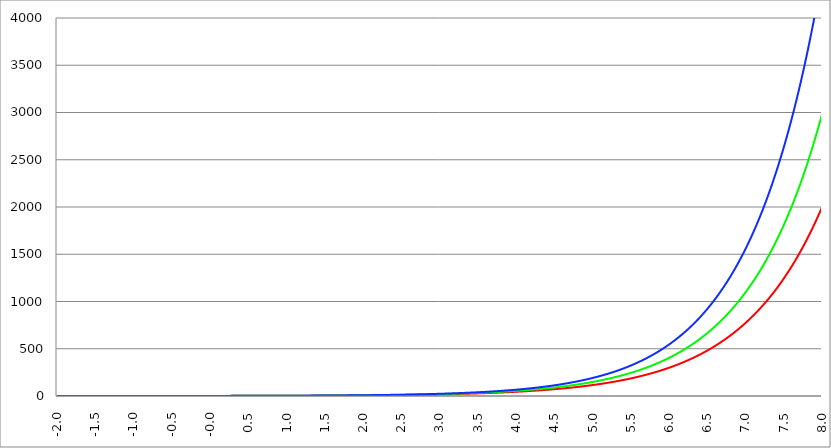
| Category | Series 1 | Series 0 | Series 2 |
|---|---|---|---|
| -2.0 | 0.15 | 0.135 | 0.122 |
| -1.995 | 0.15 | 0.136 | 0.123 |
| -1.99 | 0.151 | 0.137 | 0.124 |
| -1.985 | 0.152 | 0.137 | 0.124 |
| -1.98 | 0.152 | 0.138 | 0.125 |
| -1.975000000000001 | 0.153 | 0.139 | 0.126 |
| -1.970000000000001 | 0.154 | 0.139 | 0.126 |
| -1.965000000000001 | 0.155 | 0.14 | 0.127 |
| -1.960000000000001 | 0.155 | 0.141 | 0.128 |
| -1.955000000000001 | 0.156 | 0.142 | 0.128 |
| -1.950000000000001 | 0.157 | 0.142 | 0.129 |
| -1.945000000000001 | 0.158 | 0.143 | 0.13 |
| -1.940000000000001 | 0.158 | 0.144 | 0.13 |
| -1.935000000000001 | 0.159 | 0.144 | 0.131 |
| -1.930000000000001 | 0.16 | 0.145 | 0.132 |
| -1.925000000000002 | 0.161 | 0.146 | 0.132 |
| -1.920000000000002 | 0.161 | 0.147 | 0.133 |
| -1.915000000000002 | 0.162 | 0.147 | 0.134 |
| -1.910000000000002 | 0.163 | 0.148 | 0.135 |
| -1.905000000000002 | 0.164 | 0.149 | 0.135 |
| -1.900000000000002 | 0.164 | 0.15 | 0.136 |
| -1.895000000000002 | 0.165 | 0.15 | 0.137 |
| -1.890000000000002 | 0.166 | 0.151 | 0.137 |
| -1.885000000000002 | 0.167 | 0.152 | 0.138 |
| -1.880000000000002 | 0.168 | 0.153 | 0.139 |
| -1.875000000000003 | 0.168 | 0.153 | 0.14 |
| -1.870000000000003 | 0.169 | 0.154 | 0.14 |
| -1.865000000000003 | 0.17 | 0.155 | 0.141 |
| -1.860000000000003 | 0.171 | 0.156 | 0.142 |
| -1.855000000000003 | 0.172 | 0.156 | 0.143 |
| -1.850000000000003 | 0.172 | 0.157 | 0.143 |
| -1.845000000000003 | 0.173 | 0.158 | 0.144 |
| -1.840000000000003 | 0.174 | 0.159 | 0.145 |
| -1.835000000000003 | 0.175 | 0.16 | 0.146 |
| -1.830000000000004 | 0.176 | 0.16 | 0.146 |
| -1.825000000000004 | 0.177 | 0.161 | 0.147 |
| -1.820000000000004 | 0.177 | 0.162 | 0.148 |
| -1.815000000000004 | 0.178 | 0.163 | 0.149 |
| -1.810000000000004 | 0.179 | 0.164 | 0.149 |
| -1.805000000000004 | 0.18 | 0.164 | 0.15 |
| -1.800000000000004 | 0.181 | 0.165 | 0.151 |
| -1.795000000000004 | 0.182 | 0.166 | 0.152 |
| -1.790000000000004 | 0.183 | 0.167 | 0.153 |
| -1.785000000000004 | 0.183 | 0.168 | 0.153 |
| -1.780000000000005 | 0.184 | 0.169 | 0.154 |
| -1.775000000000005 | 0.185 | 0.169 | 0.155 |
| -1.770000000000005 | 0.186 | 0.17 | 0.156 |
| -1.765000000000005 | 0.187 | 0.171 | 0.157 |
| -1.760000000000005 | 0.188 | 0.172 | 0.158 |
| -1.755000000000005 | 0.189 | 0.173 | 0.158 |
| -1.750000000000005 | 0.19 | 0.174 | 0.159 |
| -1.745000000000005 | 0.191 | 0.175 | 0.16 |
| -1.740000000000005 | 0.191 | 0.176 | 0.161 |
| -1.735000000000006 | 0.192 | 0.176 | 0.162 |
| -1.730000000000006 | 0.193 | 0.177 | 0.163 |
| -1.725000000000006 | 0.194 | 0.178 | 0.163 |
| -1.720000000000006 | 0.195 | 0.179 | 0.164 |
| -1.715000000000006 | 0.196 | 0.18 | 0.165 |
| -1.710000000000006 | 0.197 | 0.181 | 0.166 |
| -1.705000000000006 | 0.198 | 0.182 | 0.167 |
| -1.700000000000006 | 0.199 | 0.183 | 0.168 |
| -1.695000000000006 | 0.2 | 0.184 | 0.169 |
| -1.690000000000006 | 0.201 | 0.185 | 0.17 |
| -1.685000000000007 | 0.202 | 0.185 | 0.17 |
| -1.680000000000007 | 0.203 | 0.186 | 0.171 |
| -1.675000000000007 | 0.204 | 0.187 | 0.172 |
| -1.670000000000007 | 0.205 | 0.188 | 0.173 |
| -1.665000000000007 | 0.206 | 0.189 | 0.174 |
| -1.660000000000007 | 0.207 | 0.19 | 0.175 |
| -1.655000000000007 | 0.208 | 0.191 | 0.176 |
| -1.650000000000007 | 0.209 | 0.192 | 0.177 |
| -1.645000000000007 | 0.21 | 0.193 | 0.178 |
| -1.640000000000008 | 0.211 | 0.194 | 0.179 |
| -1.635000000000008 | 0.212 | 0.195 | 0.18 |
| -1.630000000000008 | 0.213 | 0.196 | 0.181 |
| -1.625000000000008 | 0.214 | 0.197 | 0.182 |
| -1.620000000000008 | 0.215 | 0.198 | 0.183 |
| -1.615000000000008 | 0.216 | 0.199 | 0.183 |
| -1.610000000000008 | 0.217 | 0.2 | 0.184 |
| -1.605000000000008 | 0.218 | 0.201 | 0.185 |
| -1.600000000000008 | 0.219 | 0.202 | 0.186 |
| -1.595000000000009 | 0.22 | 0.203 | 0.187 |
| -1.590000000000009 | 0.221 | 0.204 | 0.188 |
| -1.585000000000009 | 0.222 | 0.205 | 0.189 |
| -1.580000000000009 | 0.223 | 0.206 | 0.19 |
| -1.57500000000001 | 0.224 | 0.207 | 0.191 |
| -1.57000000000001 | 0.225 | 0.208 | 0.192 |
| -1.565000000000009 | 0.226 | 0.209 | 0.193 |
| -1.560000000000009 | 0.227 | 0.21 | 0.194 |
| -1.555000000000009 | 0.228 | 0.211 | 0.195 |
| -1.55000000000001 | 0.229 | 0.212 | 0.196 |
| -1.54500000000001 | 0.23 | 0.213 | 0.197 |
| -1.54000000000001 | 0.232 | 0.214 | 0.198 |
| -1.53500000000001 | 0.233 | 0.215 | 0.2 |
| -1.53000000000001 | 0.234 | 0.217 | 0.201 |
| -1.52500000000001 | 0.235 | 0.218 | 0.202 |
| -1.52000000000001 | 0.236 | 0.219 | 0.203 |
| -1.51500000000001 | 0.237 | 0.22 | 0.204 |
| -1.51000000000001 | 0.238 | 0.221 | 0.205 |
| -1.505000000000011 | 0.239 | 0.222 | 0.206 |
| -1.500000000000011 | 0.241 | 0.223 | 0.207 |
| -1.495000000000011 | 0.242 | 0.224 | 0.208 |
| -1.490000000000011 | 0.243 | 0.225 | 0.209 |
| -1.485000000000011 | 0.244 | 0.227 | 0.21 |
| -1.480000000000011 | 0.245 | 0.228 | 0.211 |
| -1.475000000000011 | 0.246 | 0.229 | 0.213 |
| -1.470000000000011 | 0.247 | 0.23 | 0.214 |
| -1.465000000000011 | 0.249 | 0.231 | 0.215 |
| -1.460000000000011 | 0.25 | 0.232 | 0.216 |
| -1.455000000000012 | 0.251 | 0.233 | 0.217 |
| -1.450000000000012 | 0.252 | 0.235 | 0.218 |
| -1.445000000000012 | 0.253 | 0.236 | 0.219 |
| -1.440000000000012 | 0.255 | 0.237 | 0.22 |
| -1.435000000000012 | 0.256 | 0.238 | 0.222 |
| -1.430000000000012 | 0.257 | 0.239 | 0.223 |
| -1.425000000000012 | 0.258 | 0.241 | 0.224 |
| -1.420000000000012 | 0.259 | 0.242 | 0.225 |
| -1.415000000000012 | 0.261 | 0.243 | 0.226 |
| -1.410000000000013 | 0.262 | 0.244 | 0.228 |
| -1.405000000000013 | 0.263 | 0.245 | 0.229 |
| -1.400000000000013 | 0.264 | 0.247 | 0.23 |
| -1.395000000000013 | 0.266 | 0.248 | 0.231 |
| -1.390000000000013 | 0.267 | 0.249 | 0.232 |
| -1.385000000000013 | 0.268 | 0.25 | 0.234 |
| -1.380000000000013 | 0.27 | 0.252 | 0.235 |
| -1.375000000000013 | 0.271 | 0.253 | 0.236 |
| -1.370000000000013 | 0.272 | 0.254 | 0.237 |
| -1.365000000000013 | 0.273 | 0.255 | 0.239 |
| -1.360000000000014 | 0.275 | 0.257 | 0.24 |
| -1.355000000000014 | 0.276 | 0.258 | 0.241 |
| -1.350000000000014 | 0.277 | 0.259 | 0.242 |
| -1.345000000000014 | 0.279 | 0.261 | 0.244 |
| -1.340000000000014 | 0.28 | 0.262 | 0.245 |
| -1.335000000000014 | 0.281 | 0.263 | 0.246 |
| -1.330000000000014 | 0.283 | 0.264 | 0.247 |
| -1.325000000000014 | 0.284 | 0.266 | 0.249 |
| -1.320000000000014 | 0.285 | 0.267 | 0.25 |
| -1.315000000000015 | 0.287 | 0.268 | 0.251 |
| -1.310000000000015 | 0.288 | 0.27 | 0.253 |
| -1.305000000000015 | 0.289 | 0.271 | 0.254 |
| -1.300000000000015 | 0.291 | 0.273 | 0.255 |
| -1.295000000000015 | 0.292 | 0.274 | 0.257 |
| -1.290000000000015 | 0.294 | 0.275 | 0.258 |
| -1.285000000000015 | 0.295 | 0.277 | 0.259 |
| -1.280000000000015 | 0.296 | 0.278 | 0.261 |
| -1.275000000000015 | 0.298 | 0.279 | 0.262 |
| -1.270000000000016 | 0.299 | 0.281 | 0.264 |
| -1.265000000000016 | 0.301 | 0.282 | 0.265 |
| -1.260000000000016 | 0.302 | 0.284 | 0.266 |
| -1.255000000000016 | 0.304 | 0.285 | 0.268 |
| -1.250000000000016 | 0.305 | 0.287 | 0.269 |
| -1.245000000000016 | 0.306 | 0.288 | 0.271 |
| -1.240000000000016 | 0.308 | 0.289 | 0.272 |
| -1.235000000000016 | 0.309 | 0.291 | 0.273 |
| -1.230000000000016 | 0.311 | 0.292 | 0.275 |
| -1.225000000000017 | 0.312 | 0.294 | 0.276 |
| -1.220000000000017 | 0.314 | 0.295 | 0.278 |
| -1.215000000000017 | 0.315 | 0.297 | 0.279 |
| -1.210000000000017 | 0.317 | 0.298 | 0.281 |
| -1.205000000000017 | 0.318 | 0.3 | 0.282 |
| -1.200000000000017 | 0.32 | 0.301 | 0.284 |
| -1.195000000000017 | 0.321 | 0.303 | 0.285 |
| -1.190000000000017 | 0.323 | 0.304 | 0.287 |
| -1.185000000000017 | 0.324 | 0.306 | 0.288 |
| -1.180000000000017 | 0.326 | 0.307 | 0.29 |
| -1.175000000000018 | 0.328 | 0.309 | 0.291 |
| -1.170000000000018 | 0.329 | 0.31 | 0.293 |
| -1.165000000000018 | 0.331 | 0.312 | 0.294 |
| -1.160000000000018 | 0.332 | 0.313 | 0.296 |
| -1.155000000000018 | 0.334 | 0.315 | 0.297 |
| -1.150000000000018 | 0.335 | 0.317 | 0.299 |
| -1.145000000000018 | 0.337 | 0.318 | 0.301 |
| -1.140000000000018 | 0.339 | 0.32 | 0.302 |
| -1.135000000000018 | 0.34 | 0.321 | 0.304 |
| -1.130000000000019 | 0.342 | 0.323 | 0.305 |
| -1.125000000000019 | 0.343 | 0.325 | 0.307 |
| -1.120000000000019 | 0.345 | 0.326 | 0.309 |
| -1.115000000000019 | 0.347 | 0.328 | 0.31 |
| -1.110000000000019 | 0.348 | 0.33 | 0.312 |
| -1.10500000000002 | 0.35 | 0.331 | 0.313 |
| -1.10000000000002 | 0.352 | 0.333 | 0.315 |
| -1.095000000000019 | 0.353 | 0.335 | 0.317 |
| -1.090000000000019 | 0.355 | 0.336 | 0.318 |
| -1.085000000000019 | 0.357 | 0.338 | 0.32 |
| -1.08000000000002 | 0.358 | 0.34 | 0.322 |
| -1.07500000000002 | 0.36 | 0.341 | 0.323 |
| -1.07000000000002 | 0.362 | 0.343 | 0.325 |
| -1.06500000000002 | 0.364 | 0.345 | 0.327 |
| -1.06000000000002 | 0.365 | 0.346 | 0.329 |
| -1.05500000000002 | 0.367 | 0.348 | 0.33 |
| -1.05000000000002 | 0.369 | 0.35 | 0.332 |
| -1.04500000000002 | 0.371 | 0.352 | 0.334 |
| -1.04000000000002 | 0.372 | 0.353 | 0.336 |
| -1.035000000000021 | 0.374 | 0.355 | 0.337 |
| -1.030000000000021 | 0.376 | 0.357 | 0.339 |
| -1.025000000000021 | 0.378 | 0.359 | 0.341 |
| -1.020000000000021 | 0.379 | 0.361 | 0.343 |
| -1.015000000000021 | 0.381 | 0.362 | 0.344 |
| -1.010000000000021 | 0.383 | 0.364 | 0.346 |
| -1.005000000000021 | 0.385 | 0.366 | 0.348 |
| -1.000000000000021 | 0.387 | 0.368 | 0.35 |
| -0.995000000000021 | 0.389 | 0.37 | 0.352 |
| -0.990000000000021 | 0.39 | 0.372 | 0.354 |
| -0.985000000000021 | 0.392 | 0.373 | 0.355 |
| -0.980000000000021 | 0.394 | 0.375 | 0.357 |
| -0.975000000000021 | 0.396 | 0.377 | 0.359 |
| -0.970000000000021 | 0.398 | 0.379 | 0.361 |
| -0.965000000000021 | 0.4 | 0.381 | 0.363 |
| -0.960000000000021 | 0.402 | 0.383 | 0.365 |
| -0.955000000000021 | 0.404 | 0.385 | 0.367 |
| -0.950000000000021 | 0.406 | 0.387 | 0.369 |
| -0.945000000000021 | 0.407 | 0.389 | 0.371 |
| -0.940000000000021 | 0.409 | 0.391 | 0.373 |
| -0.935000000000021 | 0.411 | 0.393 | 0.375 |
| -0.930000000000021 | 0.413 | 0.395 | 0.377 |
| -0.925000000000021 | 0.415 | 0.397 | 0.379 |
| -0.920000000000021 | 0.417 | 0.399 | 0.381 |
| -0.915000000000021 | 0.419 | 0.401 | 0.383 |
| -0.910000000000021 | 0.421 | 0.403 | 0.385 |
| -0.905000000000021 | 0.423 | 0.405 | 0.387 |
| -0.900000000000021 | 0.425 | 0.407 | 0.389 |
| -0.895000000000021 | 0.427 | 0.409 | 0.391 |
| -0.890000000000021 | 0.429 | 0.411 | 0.393 |
| -0.885000000000021 | 0.431 | 0.413 | 0.395 |
| -0.880000000000021 | 0.433 | 0.415 | 0.397 |
| -0.875000000000021 | 0.436 | 0.417 | 0.399 |
| -0.870000000000021 | 0.438 | 0.419 | 0.401 |
| -0.865000000000021 | 0.44 | 0.421 | 0.403 |
| -0.860000000000021 | 0.442 | 0.423 | 0.405 |
| -0.855000000000021 | 0.444 | 0.425 | 0.407 |
| -0.850000000000021 | 0.446 | 0.427 | 0.41 |
| -0.845000000000021 | 0.448 | 0.43 | 0.412 |
| -0.840000000000021 | 0.45 | 0.432 | 0.414 |
| -0.835000000000021 | 0.452 | 0.434 | 0.416 |
| -0.830000000000021 | 0.455 | 0.436 | 0.418 |
| -0.825000000000021 | 0.457 | 0.438 | 0.421 |
| -0.820000000000021 | 0.459 | 0.44 | 0.423 |
| -0.815000000000021 | 0.461 | 0.443 | 0.425 |
| -0.810000000000021 | 0.463 | 0.445 | 0.427 |
| -0.805000000000021 | 0.465 | 0.447 | 0.429 |
| -0.800000000000021 | 0.468 | 0.449 | 0.432 |
| -0.795000000000021 | 0.47 | 0.452 | 0.434 |
| -0.790000000000021 | 0.472 | 0.454 | 0.436 |
| -0.785000000000021 | 0.474 | 0.456 | 0.439 |
| -0.780000000000021 | 0.477 | 0.458 | 0.441 |
| -0.775000000000021 | 0.479 | 0.461 | 0.443 |
| -0.770000000000021 | 0.481 | 0.463 | 0.446 |
| -0.765000000000021 | 0.483 | 0.465 | 0.448 |
| -0.760000000000021 | 0.486 | 0.468 | 0.45 |
| -0.755000000000021 | 0.488 | 0.47 | 0.453 |
| -0.750000000000021 | 0.49 | 0.472 | 0.455 |
| -0.745000000000021 | 0.493 | 0.475 | 0.457 |
| -0.740000000000021 | 0.495 | 0.477 | 0.46 |
| -0.735000000000021 | 0.497 | 0.48 | 0.462 |
| -0.730000000000021 | 0.5 | 0.482 | 0.465 |
| -0.725000000000021 | 0.502 | 0.484 | 0.467 |
| -0.720000000000021 | 0.505 | 0.487 | 0.47 |
| -0.715000000000021 | 0.507 | 0.489 | 0.472 |
| -0.710000000000021 | 0.509 | 0.492 | 0.474 |
| -0.705000000000021 | 0.512 | 0.494 | 0.477 |
| -0.700000000000021 | 0.514 | 0.497 | 0.48 |
| -0.695000000000021 | 0.517 | 0.499 | 0.482 |
| -0.690000000000021 | 0.519 | 0.502 | 0.485 |
| -0.685000000000021 | 0.522 | 0.504 | 0.487 |
| -0.680000000000021 | 0.524 | 0.507 | 0.49 |
| -0.675000000000021 | 0.527 | 0.509 | 0.492 |
| -0.670000000000021 | 0.529 | 0.512 | 0.495 |
| -0.665000000000021 | 0.532 | 0.514 | 0.497 |
| -0.660000000000021 | 0.534 | 0.517 | 0.5 |
| -0.655000000000021 | 0.537 | 0.519 | 0.503 |
| -0.650000000000021 | 0.539 | 0.522 | 0.505 |
| -0.645000000000021 | 0.542 | 0.525 | 0.508 |
| -0.640000000000021 | 0.544 | 0.527 | 0.511 |
| -0.635000000000021 | 0.547 | 0.53 | 0.513 |
| -0.630000000000021 | 0.55 | 0.533 | 0.516 |
| -0.625000000000021 | 0.552 | 0.535 | 0.519 |
| -0.620000000000021 | 0.555 | 0.538 | 0.522 |
| -0.615000000000021 | 0.558 | 0.541 | 0.524 |
| -0.610000000000021 | 0.56 | 0.543 | 0.527 |
| -0.605000000000021 | 0.563 | 0.546 | 0.53 |
| -0.600000000000021 | 0.566 | 0.549 | 0.533 |
| -0.595000000000021 | 0.568 | 0.552 | 0.535 |
| -0.590000000000021 | 0.571 | 0.554 | 0.538 |
| -0.585000000000021 | 0.574 | 0.557 | 0.541 |
| -0.580000000000021 | 0.576 | 0.56 | 0.544 |
| -0.575000000000021 | 0.579 | 0.563 | 0.547 |
| -0.570000000000021 | 0.582 | 0.566 | 0.55 |
| -0.565000000000021 | 0.585 | 0.568 | 0.553 |
| -0.560000000000021 | 0.587 | 0.571 | 0.555 |
| -0.555000000000021 | 0.59 | 0.574 | 0.558 |
| -0.550000000000021 | 0.593 | 0.577 | 0.561 |
| -0.545000000000021 | 0.596 | 0.58 | 0.564 |
| -0.540000000000021 | 0.599 | 0.583 | 0.567 |
| -0.535000000000021 | 0.602 | 0.586 | 0.57 |
| -0.530000000000021 | 0.604 | 0.589 | 0.573 |
| -0.525000000000021 | 0.607 | 0.592 | 0.576 |
| -0.520000000000021 | 0.61 | 0.595 | 0.579 |
| -0.515000000000021 | 0.613 | 0.598 | 0.582 |
| -0.510000000000021 | 0.616 | 0.6 | 0.585 |
| -0.505000000000021 | 0.619 | 0.604 | 0.588 |
| -0.500000000000021 | 0.622 | 0.607 | 0.592 |
| -0.495000000000021 | 0.625 | 0.61 | 0.595 |
| -0.490000000000021 | 0.628 | 0.613 | 0.598 |
| -0.485000000000021 | 0.631 | 0.616 | 0.601 |
| -0.480000000000021 | 0.634 | 0.619 | 0.604 |
| -0.475000000000021 | 0.637 | 0.622 | 0.607 |
| -0.470000000000021 | 0.64 | 0.625 | 0.61 |
| -0.465000000000021 | 0.643 | 0.628 | 0.614 |
| -0.460000000000021 | 0.646 | 0.631 | 0.617 |
| -0.455000000000021 | 0.649 | 0.634 | 0.62 |
| -0.450000000000021 | 0.652 | 0.638 | 0.623 |
| -0.445000000000021 | 0.655 | 0.641 | 0.627 |
| -0.440000000000021 | 0.658 | 0.644 | 0.63 |
| -0.435000000000021 | 0.661 | 0.647 | 0.633 |
| -0.430000000000021 | 0.665 | 0.651 | 0.637 |
| -0.425000000000021 | 0.668 | 0.654 | 0.64 |
| -0.420000000000021 | 0.671 | 0.657 | 0.643 |
| -0.415000000000021 | 0.674 | 0.66 | 0.647 |
| -0.410000000000021 | 0.677 | 0.664 | 0.65 |
| -0.405000000000021 | 0.681 | 0.667 | 0.654 |
| -0.400000000000021 | 0.684 | 0.67 | 0.657 |
| -0.395000000000021 | 0.687 | 0.674 | 0.661 |
| -0.390000000000021 | 0.69 | 0.677 | 0.664 |
| -0.385000000000021 | 0.694 | 0.68 | 0.667 |
| -0.380000000000021 | 0.697 | 0.684 | 0.671 |
| -0.375000000000021 | 0.7 | 0.687 | 0.675 |
| -0.370000000000021 | 0.704 | 0.691 | 0.678 |
| -0.365000000000021 | 0.707 | 0.694 | 0.682 |
| -0.360000000000021 | 0.71 | 0.698 | 0.685 |
| -0.355000000000021 | 0.714 | 0.701 | 0.689 |
| -0.350000000000021 | 0.717 | 0.705 | 0.692 |
| -0.345000000000021 | 0.721 | 0.708 | 0.696 |
| -0.340000000000021 | 0.724 | 0.712 | 0.7 |
| -0.335000000000021 | 0.727 | 0.715 | 0.703 |
| -0.330000000000021 | 0.731 | 0.719 | 0.707 |
| -0.325000000000021 | 0.734 | 0.723 | 0.711 |
| -0.320000000000021 | 0.738 | 0.726 | 0.715 |
| -0.315000000000021 | 0.741 | 0.73 | 0.718 |
| -0.310000000000021 | 0.745 | 0.733 | 0.722 |
| -0.305000000000021 | 0.748 | 0.737 | 0.726 |
| -0.300000000000021 | 0.752 | 0.741 | 0.73 |
| -0.295000000000021 | 0.756 | 0.745 | 0.734 |
| -0.290000000000021 | 0.759 | 0.748 | 0.737 |
| -0.285000000000021 | 0.763 | 0.752 | 0.741 |
| -0.280000000000021 | 0.766 | 0.756 | 0.745 |
| -0.275000000000021 | 0.77 | 0.76 | 0.749 |
| -0.270000000000021 | 0.774 | 0.763 | 0.753 |
| -0.265000000000021 | 0.777 | 0.767 | 0.757 |
| -0.260000000000021 | 0.781 | 0.771 | 0.761 |
| -0.255000000000021 | 0.785 | 0.775 | 0.765 |
| -0.250000000000021 | 0.789 | 0.779 | 0.769 |
| -0.245000000000021 | 0.792 | 0.783 | 0.773 |
| -0.240000000000021 | 0.796 | 0.787 | 0.777 |
| -0.235000000000021 | 0.8 | 0.791 | 0.781 |
| -0.230000000000021 | 0.804 | 0.795 | 0.785 |
| -0.225000000000021 | 0.808 | 0.799 | 0.79 |
| -0.220000000000021 | 0.811 | 0.803 | 0.794 |
| -0.215000000000021 | 0.815 | 0.807 | 0.798 |
| -0.210000000000021 | 0.819 | 0.811 | 0.802 |
| -0.205000000000021 | 0.823 | 0.815 | 0.806 |
| -0.200000000000021 | 0.827 | 0.819 | 0.811 |
| -0.195000000000021 | 0.831 | 0.823 | 0.815 |
| -0.190000000000021 | 0.835 | 0.827 | 0.819 |
| -0.185000000000021 | 0.839 | 0.831 | 0.823 |
| -0.180000000000021 | 0.843 | 0.835 | 0.828 |
| -0.175000000000021 | 0.847 | 0.839 | 0.832 |
| -0.170000000000021 | 0.851 | 0.844 | 0.837 |
| -0.165000000000021 | 0.855 | 0.848 | 0.841 |
| -0.160000000000021 | 0.859 | 0.852 | 0.845 |
| -0.155000000000021 | 0.863 | 0.856 | 0.85 |
| -0.150000000000021 | 0.867 | 0.861 | 0.854 |
| -0.145000000000021 | 0.871 | 0.865 | 0.859 |
| -0.140000000000021 | 0.875 | 0.869 | 0.863 |
| -0.135000000000021 | 0.88 | 0.874 | 0.868 |
| -0.130000000000021 | 0.884 | 0.878 | 0.872 |
| -0.125000000000021 | 0.888 | 0.882 | 0.877 |
| -0.120000000000021 | 0.892 | 0.887 | 0.882 |
| -0.115000000000021 | 0.897 | 0.891 | 0.886 |
| -0.110000000000021 | 0.901 | 0.896 | 0.891 |
| -0.105000000000021 | 0.905 | 0.9 | 0.896 |
| -0.100000000000021 | 0.909 | 0.905 | 0.9 |
| -0.0950000000000205 | 0.914 | 0.909 | 0.905 |
| -0.0900000000000205 | 0.918 | 0.914 | 0.91 |
| -0.0850000000000205 | 0.922 | 0.919 | 0.915 |
| -0.0800000000000205 | 0.927 | 0.923 | 0.919 |
| -0.0750000000000205 | 0.931 | 0.928 | 0.924 |
| -0.0700000000000205 | 0.936 | 0.932 | 0.929 |
| -0.0650000000000205 | 0.94 | 0.937 | 0.934 |
| -0.0600000000000205 | 0.945 | 0.942 | 0.939 |
| -0.0550000000000205 | 0.949 | 0.946 | 0.944 |
| -0.0500000000000205 | 0.954 | 0.951 | 0.949 |
| -0.0450000000000205 | 0.958 | 0.956 | 0.954 |
| -0.0400000000000205 | 0.963 | 0.961 | 0.959 |
| -0.0350000000000205 | 0.967 | 0.966 | 0.964 |
| -0.0300000000000205 | 0.972 | 0.97 | 0.969 |
| -0.0250000000000205 | 0.977 | 0.975 | 0.974 |
| -0.0200000000000205 | 0.981 | 0.98 | 0.979 |
| -0.0150000000000205 | 0.986 | 0.985 | 0.984 |
| -0.0100000000000205 | 0.991 | 0.99 | 0.99 |
| -0.00500000000002049 | 0.995 | 0.995 | 0.995 |
| -2.0495757868666e-14 | 1 | 1 | 1 |
| 0.0049999999999795 | 1.005 | 1.005 | 1.005 |
| 0.0099999999999795 | 1.01 | 1.01 | 1.011 |
| 0.0149999999999795 | 1.014 | 1.015 | 1.016 |
| 0.0199999999999795 | 1.019 | 1.02 | 1.021 |
| 0.0249999999999795 | 1.024 | 1.025 | 1.027 |
| 0.0299999999999795 | 1.029 | 1.03 | 1.032 |
| 0.0349999999999795 | 1.034 | 1.036 | 1.037 |
| 0.0399999999999795 | 1.039 | 1.041 | 1.043 |
| 0.0449999999999795 | 1.044 | 1.046 | 1.048 |
| 0.0499999999999795 | 1.049 | 1.051 | 1.054 |
| 0.0549999999999795 | 1.054 | 1.057 | 1.059 |
| 0.0599999999999795 | 1.059 | 1.062 | 1.065 |
| 0.0649999999999795 | 1.064 | 1.067 | 1.071 |
| 0.0699999999999795 | 1.069 | 1.073 | 1.076 |
| 0.0749999999999795 | 1.074 | 1.078 | 1.082 |
| 0.0799999999999795 | 1.079 | 1.083 | 1.088 |
| 0.0849999999999795 | 1.084 | 1.089 | 1.093 |
| 0.0899999999999795 | 1.089 | 1.094 | 1.099 |
| 0.0949999999999795 | 1.094 | 1.1 | 1.105 |
| 0.0999999999999795 | 1.1 | 1.105 | 1.111 |
| 0.10499999999998 | 1.105 | 1.111 | 1.117 |
| 0.10999999999998 | 1.11 | 1.116 | 1.122 |
| 0.11499999999998 | 1.115 | 1.122 | 1.128 |
| 0.11999999999998 | 1.121 | 1.127 | 1.134 |
| 0.12499999999998 | 1.126 | 1.133 | 1.14 |
| 0.12999999999998 | 1.131 | 1.139 | 1.146 |
| 0.13499999999998 | 1.137 | 1.145 | 1.152 |
| 0.13999999999998 | 1.142 | 1.15 | 1.158 |
| 0.14499999999998 | 1.148 | 1.156 | 1.164 |
| 0.14999999999998 | 1.153 | 1.162 | 1.171 |
| 0.15499999999998 | 1.159 | 1.168 | 1.177 |
| 0.15999999999998 | 1.164 | 1.174 | 1.183 |
| 0.16499999999998 | 1.17 | 1.179 | 1.189 |
| 0.16999999999998 | 1.175 | 1.185 | 1.195 |
| 0.17499999999998 | 1.181 | 1.191 | 1.202 |
| 0.17999999999998 | 1.186 | 1.197 | 1.208 |
| 0.18499999999998 | 1.192 | 1.203 | 1.214 |
| 0.18999999999998 | 1.198 | 1.209 | 1.221 |
| 0.19499999999998 | 1.204 | 1.215 | 1.227 |
| 0.19999999999998 | 1.209 | 1.221 | 1.234 |
| 0.20499999999998 | 1.215 | 1.228 | 1.24 |
| 0.20999999999998 | 1.221 | 1.234 | 1.247 |
| 0.21499999999998 | 1.227 | 1.24 | 1.253 |
| 0.21999999999998 | 1.232 | 1.246 | 1.26 |
| 0.22499999999998 | 1.238 | 1.252 | 1.266 |
| 0.22999999999998 | 1.244 | 1.259 | 1.273 |
| 0.23499999999998 | 1.25 | 1.265 | 1.28 |
| 0.23999999999998 | 1.256 | 1.271 | 1.287 |
| 0.24499999999998 | 1.262 | 1.278 | 1.293 |
| 0.24999999999998 | 1.268 | 1.284 | 1.3 |
| 0.25499999999998 | 1.274 | 1.29 | 1.307 |
| 0.25999999999998 | 1.28 | 1.297 | 1.314 |
| 0.26499999999998 | 1.286 | 1.303 | 1.321 |
| 0.26999999999998 | 1.292 | 1.31 | 1.328 |
| 0.27499999999998 | 1.299 | 1.317 | 1.335 |
| 0.27999999999998 | 1.305 | 1.323 | 1.342 |
| 0.28499999999998 | 1.311 | 1.33 | 1.349 |
| 0.28999999999998 | 1.317 | 1.336 | 1.356 |
| 0.29499999999998 | 1.323 | 1.343 | 1.363 |
| 0.29999999999998 | 1.33 | 1.35 | 1.37 |
| 0.30499999999998 | 1.336 | 1.357 | 1.377 |
| 0.30999999999998 | 1.342 | 1.363 | 1.385 |
| 0.31499999999998 | 1.349 | 1.37 | 1.392 |
| 0.31999999999998 | 1.355 | 1.377 | 1.399 |
| 0.32499999999998 | 1.362 | 1.384 | 1.407 |
| 0.32999999999998 | 1.368 | 1.391 | 1.414 |
| 0.33499999999998 | 1.375 | 1.398 | 1.422 |
| 0.33999999999998 | 1.381 | 1.405 | 1.429 |
| 0.34499999999998 | 1.388 | 1.412 | 1.437 |
| 0.34999999999998 | 1.394 | 1.419 | 1.444 |
| 0.35499999999998 | 1.401 | 1.426 | 1.452 |
| 0.35999999999998 | 1.408 | 1.433 | 1.459 |
| 0.36499999999998 | 1.414 | 1.441 | 1.467 |
| 0.36999999999998 | 1.421 | 1.448 | 1.475 |
| 0.37499999999998 | 1.428 | 1.455 | 1.483 |
| 0.37999999999998 | 1.435 | 1.462 | 1.49 |
| 0.38499999999998 | 1.442 | 1.47 | 1.498 |
| 0.38999999999998 | 1.448 | 1.477 | 1.506 |
| 0.39499999999998 | 1.455 | 1.484 | 1.514 |
| 0.39999999999998 | 1.462 | 1.492 | 1.522 |
| 0.40499999999998 | 1.469 | 1.499 | 1.53 |
| 0.40999999999998 | 1.476 | 1.507 | 1.538 |
| 0.41499999999998 | 1.483 | 1.514 | 1.546 |
| 0.41999999999998 | 1.49 | 1.522 | 1.554 |
| 0.42499999999998 | 1.497 | 1.53 | 1.562 |
| 0.42999999999998 | 1.505 | 1.537 | 1.571 |
| 0.43499999999998 | 1.512 | 1.545 | 1.579 |
| 0.43999999999998 | 1.519 | 1.553 | 1.587 |
| 0.44499999999998 | 1.526 | 1.56 | 1.596 |
| 0.44999999999998 | 1.533 | 1.568 | 1.604 |
| 0.45499999999998 | 1.541 | 1.576 | 1.612 |
| 0.45999999999998 | 1.548 | 1.584 | 1.621 |
| 0.46499999999998 | 1.555 | 1.592 | 1.629 |
| 0.46999999999998 | 1.563 | 1.6 | 1.638 |
| 0.47499999999998 | 1.57 | 1.608 | 1.647 |
| 0.47999999999998 | 1.578 | 1.616 | 1.655 |
| 0.48499999999998 | 1.585 | 1.624 | 1.664 |
| 0.48999999999998 | 1.593 | 1.632 | 1.673 |
| 0.49499999999998 | 1.6 | 1.64 | 1.682 |
| 0.49999999999998 | 1.608 | 1.649 | 1.69 |
| 0.50499999999998 | 1.616 | 1.657 | 1.699 |
| 0.50999999999998 | 1.623 | 1.665 | 1.708 |
| 0.51499999999998 | 1.631 | 1.674 | 1.717 |
| 0.51999999999998 | 1.639 | 1.682 | 1.726 |
| 0.52499999999998 | 1.647 | 1.69 | 1.735 |
| 0.52999999999998 | 1.655 | 1.699 | 1.745 |
| 0.53499999999998 | 1.662 | 1.707 | 1.754 |
| 0.53999999999998 | 1.67 | 1.716 | 1.763 |
| 0.54499999999998 | 1.678 | 1.725 | 1.772 |
| 0.54999999999998 | 1.686 | 1.733 | 1.782 |
| 0.55499999999998 | 1.694 | 1.742 | 1.791 |
| 0.55999999999998 | 1.702 | 1.751 | 1.8 |
| 0.56499999999998 | 1.71 | 1.759 | 1.81 |
| 0.56999999999998 | 1.719 | 1.768 | 1.819 |
| 0.57499999999998 | 1.727 | 1.777 | 1.829 |
| 0.57999999999998 | 1.735 | 1.786 | 1.839 |
| 0.58499999999998 | 1.743 | 1.795 | 1.848 |
| 0.58999999999998 | 1.752 | 1.804 | 1.858 |
| 0.59499999999998 | 1.76 | 1.813 | 1.868 |
| 0.59999999999998 | 1.768 | 1.822 | 1.878 |
| 0.60499999999998 | 1.777 | 1.831 | 1.887 |
| 0.60999999999998 | 1.785 | 1.84 | 1.897 |
| 0.61499999999998 | 1.794 | 1.85 | 1.907 |
| 0.61999999999998 | 1.802 | 1.859 | 1.917 |
| 0.62499999999998 | 1.811 | 1.868 | 1.928 |
| 0.62999999999998 | 1.819 | 1.878 | 1.938 |
| 0.63499999999998 | 1.828 | 1.887 | 1.948 |
| 0.63999999999998 | 1.837 | 1.896 | 1.958 |
| 0.64499999999998 | 1.845 | 1.906 | 1.968 |
| 0.64999999999998 | 1.854 | 1.916 | 1.979 |
| 0.65499999999998 | 1.863 | 1.925 | 1.989 |
| 0.65999999999998 | 1.872 | 1.935 | 2 |
| 0.66499999999998 | 1.881 | 1.944 | 2.01 |
| 0.66999999999998 | 1.89 | 1.954 | 2.021 |
| 0.67499999999998 | 1.899 | 1.964 | 2.031 |
| 0.67999999999998 | 1.908 | 1.974 | 2.042 |
| 0.68499999999998 | 1.917 | 1.984 | 2.053 |
| 0.68999999999998 | 1.926 | 1.994 | 2.064 |
| 0.69499999999998 | 1.935 | 2.004 | 2.075 |
| 0.69999999999998 | 1.944 | 2.014 | 2.085 |
| 0.70499999999998 | 1.954 | 2.024 | 2.096 |
| 0.70999999999998 | 1.963 | 2.034 | 2.107 |
| 0.71499999999998 | 1.972 | 2.044 | 2.119 |
| 0.71999999999998 | 1.982 | 2.054 | 2.13 |
| 0.72499999999998 | 1.991 | 2.065 | 2.141 |
| 0.72999999999998 | 2.001 | 2.075 | 2.152 |
| 0.73499999999998 | 2.01 | 2.085 | 2.164 |
| 0.73999999999998 | 2.02 | 2.096 | 2.175 |
| 0.74499999999998 | 2.029 | 2.106 | 2.186 |
| 0.74999999999998 | 2.039 | 2.117 | 2.198 |
| 0.75499999999998 | 2.049 | 2.128 | 2.209 |
| 0.75999999999998 | 2.059 | 2.138 | 2.221 |
| 0.76499999999998 | 2.068 | 2.149 | 2.233 |
| 0.76999999999998 | 2.078 | 2.16 | 2.245 |
| 0.77499999999998 | 2.088 | 2.171 | 2.256 |
| 0.77999999999998 | 2.098 | 2.181 | 2.268 |
| 0.78499999999998 | 2.108 | 2.192 | 2.28 |
| 0.78999999999998 | 2.118 | 2.203 | 2.292 |
| 0.79499999999998 | 2.128 | 2.214 | 2.304 |
| 0.79999999999998 | 2.138 | 2.226 | 2.316 |
| 0.80499999999998 | 2.148 | 2.237 | 2.329 |
| 0.80999999999998 | 2.159 | 2.248 | 2.341 |
| 0.81499999999998 | 2.169 | 2.259 | 2.353 |
| 0.81999999999998 | 2.179 | 2.27 | 2.366 |
| 0.82499999999998 | 2.19 | 2.282 | 2.378 |
| 0.82999999999998 | 2.2 | 2.293 | 2.39 |
| 0.83499999999998 | 2.211 | 2.305 | 2.403 |
| 0.83999999999998 | 2.221 | 2.316 | 2.416 |
| 0.84499999999998 | 2.232 | 2.328 | 2.428 |
| 0.84999999999998 | 2.242 | 2.34 | 2.441 |
| 0.85499999999998 | 2.253 | 2.351 | 2.454 |
| 0.85999999999998 | 2.264 | 2.363 | 2.467 |
| 0.86499999999998 | 2.274 | 2.375 | 2.48 |
| 0.86999999999998 | 2.285 | 2.387 | 2.493 |
| 0.87499999999998 | 2.296 | 2.399 | 2.506 |
| 0.87999999999998 | 2.307 | 2.411 | 2.519 |
| 0.88499999999998 | 2.318 | 2.423 | 2.533 |
| 0.88999999999998 | 2.329 | 2.435 | 2.546 |
| 0.89499999999998 | 2.34 | 2.447 | 2.559 |
| 0.89999999999998 | 2.351 | 2.46 | 2.573 |
| 0.90499999999998 | 2.363 | 2.472 | 2.586 |
| 0.90999999999998 | 2.374 | 2.484 | 2.6 |
| 0.91499999999998 | 2.385 | 2.497 | 2.614 |
| 0.91999999999998 | 2.396 | 2.509 | 2.627 |
| 0.92499999999998 | 2.408 | 2.522 | 2.641 |
| 0.92999999999998 | 2.419 | 2.535 | 2.655 |
| 0.93499999999998 | 2.431 | 2.547 | 2.669 |
| 0.93999999999998 | 2.442 | 2.56 | 2.683 |
| 0.94499999999998 | 2.454 | 2.573 | 2.697 |
| 0.94999999999998 | 2.466 | 2.586 | 2.711 |
| 0.95499999999998 | 2.478 | 2.599 | 2.726 |
| 0.95999999999998 | 2.489 | 2.612 | 2.74 |
| 0.96499999999998 | 2.501 | 2.625 | 2.755 |
| 0.96999999999998 | 2.513 | 2.638 | 2.769 |
| 0.97499999999998 | 2.525 | 2.651 | 2.784 |
| 0.97999999999998 | 2.537 | 2.664 | 2.798 |
| 0.98499999999998 | 2.549 | 2.678 | 2.813 |
| 0.98999999999998 | 2.561 | 2.691 | 2.828 |
| 0.99499999999998 | 2.573 | 2.705 | 2.843 |
| 0.99999999999998 | 2.586 | 2.718 | 2.858 |
| 1.00499999999998 | 2.598 | 2.732 | 2.873 |
| 1.00999999999998 | 2.61 | 2.746 | 2.888 |
| 1.01499999999998 | 2.623 | 2.759 | 2.903 |
| 1.01999999999998 | 2.635 | 2.773 | 2.918 |
| 1.02499999999998 | 2.648 | 2.787 | 2.934 |
| 1.02999999999998 | 2.66 | 2.801 | 2.949 |
| 1.034999999999979 | 2.673 | 2.815 | 2.965 |
| 1.039999999999979 | 2.686 | 2.829 | 2.98 |
| 1.044999999999979 | 2.699 | 2.843 | 2.996 |
| 1.049999999999979 | 2.711 | 2.858 | 3.012 |
| 1.054999999999979 | 2.724 | 2.872 | 3.028 |
| 1.059999999999979 | 2.737 | 2.886 | 3.043 |
| 1.064999999999979 | 2.75 | 2.901 | 3.059 |
| 1.069999999999979 | 2.764 | 2.915 | 3.076 |
| 1.074999999999979 | 2.777 | 2.93 | 3.092 |
| 1.079999999999979 | 2.79 | 2.945 | 3.108 |
| 1.084999999999978 | 2.803 | 2.959 | 3.124 |
| 1.089999999999978 | 2.817 | 2.974 | 3.141 |
| 1.094999999999978 | 2.83 | 2.989 | 3.157 |
| 1.099999999999978 | 2.843 | 3.004 | 3.174 |
| 1.104999999999978 | 2.857 | 3.019 | 3.191 |
| 1.109999999999978 | 2.871 | 3.034 | 3.208 |
| 1.114999999999978 | 2.884 | 3.05 | 3.224 |
| 1.119999999999978 | 2.898 | 3.065 | 3.241 |
| 1.124999999999978 | 2.912 | 3.08 | 3.258 |
| 1.129999999999977 | 2.926 | 3.096 | 3.276 |
| 1.134999999999977 | 2.94 | 3.111 | 3.293 |
| 1.139999999999977 | 2.954 | 3.127 | 3.31 |
| 1.144999999999977 | 2.968 | 3.142 | 3.328 |
| 1.149999999999977 | 2.982 | 3.158 | 3.345 |
| 1.154999999999977 | 2.996 | 3.174 | 3.363 |
| 1.159999999999977 | 3.01 | 3.19 | 3.38 |
| 1.164999999999977 | 3.025 | 3.206 | 3.398 |
| 1.169999999999977 | 3.039 | 3.222 | 3.416 |
| 1.174999999999976 | 3.053 | 3.238 | 3.434 |
| 1.179999999999976 | 3.068 | 3.254 | 3.452 |
| 1.184999999999976 | 3.083 | 3.271 | 3.47 |
| 1.189999999999976 | 3.097 | 3.287 | 3.489 |
| 1.194999999999976 | 3.112 | 3.304 | 3.507 |
| 1.199999999999976 | 3.127 | 3.32 | 3.525 |
| 1.204999999999976 | 3.142 | 3.337 | 3.544 |
| 1.209999999999976 | 3.157 | 3.353 | 3.563 |
| 1.214999999999976 | 3.172 | 3.37 | 3.581 |
| 1.219999999999976 | 3.187 | 3.387 | 3.6 |
| 1.224999999999975 | 3.202 | 3.404 | 3.619 |
| 1.229999999999975 | 3.217 | 3.421 | 3.638 |
| 1.234999999999975 | 3.232 | 3.438 | 3.657 |
| 1.239999999999975 | 3.248 | 3.456 | 3.677 |
| 1.244999999999975 | 3.263 | 3.473 | 3.696 |
| 1.249999999999975 | 3.279 | 3.49 | 3.715 |
| 1.254999999999975 | 3.294 | 3.508 | 3.735 |
| 1.259999999999975 | 3.31 | 3.525 | 3.755 |
| 1.264999999999975 | 3.326 | 3.543 | 3.774 |
| 1.269999999999974 | 3.342 | 3.561 | 3.794 |
| 1.274999999999974 | 3.358 | 3.579 | 3.814 |
| 1.279999999999974 | 3.374 | 3.597 | 3.834 |
| 1.284999999999974 | 3.39 | 3.615 | 3.855 |
| 1.289999999999974 | 3.406 | 3.633 | 3.875 |
| 1.294999999999974 | 3.422 | 3.651 | 3.895 |
| 1.299999999999974 | 3.438 | 3.669 | 3.916 |
| 1.304999999999974 | 3.455 | 3.688 | 3.936 |
| 1.309999999999974 | 3.471 | 3.706 | 3.957 |
| 1.314999999999973 | 3.488 | 3.725 | 3.978 |
| 1.319999999999973 | 3.504 | 3.743 | 3.999 |
| 1.324999999999973 | 3.521 | 3.762 | 4.02 |
| 1.329999999999973 | 3.538 | 3.781 | 4.041 |
| 1.334999999999973 | 3.555 | 3.8 | 4.062 |
| 1.339999999999973 | 3.572 | 3.819 | 4.084 |
| 1.344999999999973 | 3.589 | 3.838 | 4.105 |
| 1.349999999999973 | 3.606 | 3.857 | 4.127 |
| 1.354999999999973 | 3.623 | 3.877 | 4.149 |
| 1.359999999999973 | 3.64 | 3.896 | 4.17 |
| 1.364999999999972 | 3.657 | 3.916 | 4.192 |
| 1.369999999999972 | 3.675 | 3.935 | 4.214 |
| 1.374999999999972 | 3.692 | 3.955 | 4.237 |
| 1.379999999999972 | 3.71 | 3.975 | 4.259 |
| 1.384999999999972 | 3.728 | 3.995 | 4.281 |
| 1.389999999999972 | 3.745 | 4.015 | 4.304 |
| 1.394999999999972 | 3.763 | 4.035 | 4.326 |
| 1.399999999999972 | 3.781 | 4.055 | 4.349 |
| 1.404999999999972 | 3.799 | 4.076 | 4.372 |
| 1.409999999999971 | 3.817 | 4.096 | 4.395 |
| 1.414999999999971 | 3.835 | 4.116 | 4.418 |
| 1.419999999999971 | 3.854 | 4.137 | 4.442 |
| 1.424999999999971 | 3.872 | 4.158 | 4.465 |
| 1.429999999999971 | 3.89 | 4.179 | 4.488 |
| 1.434999999999971 | 3.909 | 4.2 | 4.512 |
| 1.439999999999971 | 3.927 | 4.221 | 4.536 |
| 1.444999999999971 | 3.946 | 4.242 | 4.56 |
| 1.449999999999971 | 3.965 | 4.263 | 4.584 |
| 1.454999999999971 | 3.984 | 4.284 | 4.608 |
| 1.45999999999997 | 4.003 | 4.306 | 4.632 |
| 1.46499999999997 | 4.022 | 4.328 | 4.656 |
| 1.46999999999997 | 4.041 | 4.349 | 4.681 |
| 1.47499999999997 | 4.06 | 4.371 | 4.706 |
| 1.47999999999997 | 4.08 | 4.393 | 4.73 |
| 1.48499999999997 | 4.099 | 4.415 | 4.755 |
| 1.48999999999997 | 4.119 | 4.437 | 4.78 |
| 1.49499999999997 | 4.138 | 4.459 | 4.805 |
| 1.49999999999997 | 4.158 | 4.482 | 4.831 |
| 1.504999999999969 | 4.178 | 4.504 | 4.856 |
| 1.509999999999969 | 4.198 | 4.527 | 4.882 |
| 1.514999999999969 | 4.218 | 4.549 | 4.907 |
| 1.519999999999969 | 4.238 | 4.572 | 4.933 |
| 1.524999999999969 | 4.258 | 4.595 | 4.959 |
| 1.529999999999969 | 4.278 | 4.618 | 4.985 |
| 1.534999999999969 | 4.298 | 4.641 | 5.012 |
| 1.539999999999969 | 4.319 | 4.665 | 5.038 |
| 1.544999999999969 | 4.339 | 4.688 | 5.064 |
| 1.549999999999969 | 4.36 | 4.711 | 5.091 |
| 1.554999999999968 | 4.381 | 4.735 | 5.118 |
| 1.559999999999968 | 4.402 | 4.759 | 5.145 |
| 1.564999999999968 | 4.423 | 4.783 | 5.172 |
| 1.569999999999968 | 4.444 | 4.807 | 5.199 |
| 1.574999999999968 | 4.465 | 4.831 | 5.227 |
| 1.579999999999968 | 4.486 | 4.855 | 5.254 |
| 1.584999999999968 | 4.508 | 4.879 | 5.282 |
| 1.589999999999968 | 4.529 | 4.904 | 5.31 |
| 1.594999999999968 | 4.551 | 4.928 | 5.337 |
| 1.599999999999967 | 4.572 | 4.953 | 5.366 |
| 1.604999999999967 | 4.594 | 4.978 | 5.394 |
| 1.609999999999967 | 4.616 | 5.003 | 5.422 |
| 1.614999999999967 | 4.638 | 5.028 | 5.451 |
| 1.619999999999967 | 4.66 | 5.053 | 5.479 |
| 1.624999999999967 | 4.682 | 5.078 | 5.508 |
| 1.629999999999967 | 4.704 | 5.104 | 5.537 |
| 1.634999999999967 | 4.727 | 5.129 | 5.566 |
| 1.639999999999966 | 4.749 | 5.155 | 5.596 |
| 1.644999999999966 | 4.772 | 5.181 | 5.625 |
| 1.649999999999966 | 4.795 | 5.207 | 5.655 |
| 1.654999999999966 | 4.817 | 5.233 | 5.685 |
| 1.659999999999966 | 4.84 | 5.259 | 5.714 |
| 1.664999999999966 | 4.863 | 5.286 | 5.745 |
| 1.669999999999966 | 4.887 | 5.312 | 5.775 |
| 1.674999999999966 | 4.91 | 5.339 | 5.805 |
| 1.679999999999966 | 4.933 | 5.366 | 5.836 |
| 1.684999999999966 | 4.957 | 5.392 | 5.866 |
| 1.689999999999965 | 4.98 | 5.419 | 5.897 |
| 1.694999999999965 | 5.004 | 5.447 | 5.928 |
| 1.699999999999965 | 5.028 | 5.474 | 5.96 |
| 1.704999999999965 | 5.052 | 5.501 | 5.991 |
| 1.709999999999965 | 5.076 | 5.529 | 6.022 |
| 1.714999999999965 | 5.1 | 5.557 | 6.054 |
| 1.719999999999965 | 5.124 | 5.585 | 6.086 |
| 1.724999999999965 | 5.149 | 5.613 | 6.118 |
| 1.729999999999965 | 5.173 | 5.641 | 6.15 |
| 1.734999999999964 | 5.198 | 5.669 | 6.183 |
| 1.739999999999964 | 5.223 | 5.697 | 6.215 |
| 1.744999999999964 | 5.247 | 5.726 | 6.248 |
| 1.749999999999964 | 5.272 | 5.755 | 6.281 |
| 1.754999999999964 | 5.298 | 5.783 | 6.314 |
| 1.759999999999964 | 5.323 | 5.812 | 6.347 |
| 1.764999999999964 | 5.348 | 5.842 | 6.381 |
| 1.769999999999964 | 5.374 | 5.871 | 6.414 |
| 1.774999999999964 | 5.399 | 5.9 | 6.448 |
| 1.779999999999964 | 5.425 | 5.93 | 6.482 |
| 1.784999999999963 | 5.451 | 5.96 | 6.516 |
| 1.789999999999963 | 5.477 | 5.989 | 6.55 |
| 1.794999999999963 | 5.503 | 6.019 | 6.585 |
| 1.799999999999963 | 5.529 | 6.05 | 6.619 |
| 1.804999999999963 | 5.555 | 6.08 | 6.654 |
| 1.809999999999963 | 5.582 | 6.11 | 6.689 |
| 1.814999999999963 | 5.608 | 6.141 | 6.724 |
| 1.819999999999963 | 5.635 | 6.172 | 6.76 |
| 1.824999999999963 | 5.662 | 6.203 | 6.795 |
| 1.829999999999962 | 5.689 | 6.234 | 6.831 |
| 1.834999999999962 | 5.716 | 6.265 | 6.867 |
| 1.839999999999962 | 5.743 | 6.297 | 6.903 |
| 1.844999999999962 | 5.77 | 6.328 | 6.94 |
| 1.849999999999962 | 5.798 | 6.36 | 6.976 |
| 1.854999999999962 | 5.826 | 6.392 | 7.013 |
| 1.859999999999962 | 5.853 | 6.424 | 7.05 |
| 1.864999999999962 | 5.881 | 6.456 | 7.087 |
| 1.869999999999962 | 5.909 | 6.488 | 7.124 |
| 1.874999999999962 | 5.937 | 6.521 | 7.162 |
| 1.879999999999961 | 5.966 | 6.554 | 7.199 |
| 1.884999999999961 | 5.994 | 6.586 | 7.237 |
| 1.889999999999961 | 6.022 | 6.619 | 7.275 |
| 1.894999999999961 | 6.051 | 6.653 | 7.314 |
| 1.899999999999961 | 6.08 | 6.686 | 7.352 |
| 1.904999999999961 | 6.109 | 6.719 | 7.391 |
| 1.909999999999961 | 6.138 | 6.753 | 7.43 |
| 1.914999999999961 | 6.167 | 6.787 | 7.469 |
| 1.919999999999961 | 6.197 | 6.821 | 7.508 |
| 1.92499999999996 | 6.226 | 6.855 | 7.548 |
| 1.92999999999996 | 6.256 | 6.89 | 7.587 |
| 1.93499999999996 | 6.286 | 6.924 | 7.627 |
| 1.93999999999996 | 6.315 | 6.959 | 7.668 |
| 1.94499999999996 | 6.346 | 6.994 | 7.708 |
| 1.94999999999996 | 6.376 | 7.029 | 7.749 |
| 1.95499999999996 | 6.406 | 7.064 | 7.789 |
| 1.95999999999996 | 6.437 | 7.099 | 7.83 |
| 1.96499999999996 | 6.467 | 7.135 | 7.872 |
| 1.96999999999996 | 6.498 | 7.171 | 7.913 |
| 1.974999999999959 | 6.529 | 7.207 | 7.955 |
| 1.979999999999959 | 6.56 | 7.243 | 7.996 |
| 1.984999999999959 | 6.591 | 7.279 | 8.039 |
| 1.989999999999959 | 6.623 | 7.316 | 8.081 |
| 1.994999999999959 | 6.654 | 7.352 | 8.123 |
| 1.999999999999959 | 6.686 | 7.389 | 8.166 |
| 2.00499999999996 | 6.718 | 7.426 | 8.209 |
| 2.009999999999959 | 6.75 | 7.463 | 8.252 |
| 2.014999999999959 | 6.782 | 7.501 | 8.296 |
| 2.019999999999959 | 6.814 | 7.538 | 8.339 |
| 2.024999999999959 | 6.847 | 7.576 | 8.383 |
| 2.029999999999958 | 6.879 | 7.614 | 8.427 |
| 2.034999999999958 | 6.912 | 7.652 | 8.472 |
| 2.039999999999958 | 6.945 | 7.691 | 8.516 |
| 2.044999999999958 | 6.978 | 7.729 | 8.561 |
| 2.049999999999958 | 7.011 | 7.768 | 8.606 |
| 2.054999999999958 | 7.045 | 7.807 | 8.652 |
| 2.059999999999958 | 7.078 | 7.846 | 8.697 |
| 2.064999999999958 | 7.112 | 7.885 | 8.743 |
| 2.069999999999958 | 7.146 | 7.925 | 8.789 |
| 2.074999999999958 | 7.18 | 7.965 | 8.835 |
| 2.079999999999957 | 7.214 | 8.004 | 8.882 |
| 2.084999999999957 | 7.248 | 8.045 | 8.929 |
| 2.089999999999957 | 7.283 | 8.085 | 8.976 |
| 2.094999999999957 | 7.317 | 8.125 | 9.023 |
| 2.099999999999957 | 7.352 | 8.166 | 9.07 |
| 2.104999999999957 | 7.387 | 8.207 | 9.118 |
| 2.109999999999957 | 7.422 | 8.248 | 9.166 |
| 2.114999999999957 | 7.458 | 8.29 | 9.214 |
| 2.119999999999957 | 7.493 | 8.331 | 9.263 |
| 2.124999999999956 | 7.529 | 8.373 | 9.311 |
| 2.129999999999956 | 7.565 | 8.415 | 9.361 |
| 2.134999999999956 | 7.601 | 8.457 | 9.41 |
| 2.139999999999956 | 7.637 | 8.499 | 9.459 |
| 2.144999999999956 | 7.673 | 8.542 | 9.509 |
| 2.149999999999956 | 7.71 | 8.585 | 9.559 |
| 2.154999999999956 | 7.747 | 8.628 | 9.609 |
| 2.159999999999956 | 7.783 | 8.671 | 9.66 |
| 2.164999999999956 | 7.821 | 8.715 | 9.711 |
| 2.169999999999955 | 7.858 | 8.758 | 9.762 |
| 2.174999999999955 | 7.895 | 8.802 | 9.813 |
| 2.179999999999955 | 7.933 | 8.846 | 9.865 |
| 2.184999999999955 | 7.971 | 8.891 | 9.917 |
| 2.189999999999955 | 8.008 | 8.935 | 9.969 |
| 2.194999999999955 | 8.047 | 8.98 | 10.022 |
| 2.199999999999955 | 8.085 | 9.025 | 10.074 |
| 2.204999999999955 | 8.123 | 9.07 | 10.127 |
| 2.209999999999955 | 8.162 | 9.116 | 10.181 |
| 2.214999999999955 | 8.201 | 9.161 | 10.234 |
| 2.219999999999954 | 8.24 | 9.207 | 10.288 |
| 2.224999999999954 | 8.279 | 9.253 | 10.342 |
| 2.229999999999954 | 8.319 | 9.3 | 10.397 |
| 2.234999999999954 | 8.358 | 9.346 | 10.452 |
| 2.239999999999954 | 8.398 | 9.393 | 10.507 |
| 2.244999999999954 | 8.438 | 9.44 | 10.562 |
| 2.249999999999954 | 8.478 | 9.488 | 10.617 |
| 2.254999999999954 | 8.519 | 9.535 | 10.673 |
| 2.259999999999954 | 8.559 | 9.583 | 10.73 |
| 2.264999999999953 | 8.6 | 9.631 | 10.786 |
| 2.269999999999953 | 8.641 | 9.679 | 10.843 |
| 2.274999999999953 | 8.682 | 9.728 | 10.9 |
| 2.279999999999953 | 8.723 | 9.777 | 10.957 |
| 2.284999999999953 | 8.765 | 9.826 | 11.015 |
| 2.289999999999953 | 8.807 | 9.875 | 11.073 |
| 2.294999999999953 | 8.849 | 9.924 | 11.131 |
| 2.299999999999953 | 8.891 | 9.974 | 11.19 |
| 2.304999999999953 | 8.933 | 10.024 | 11.249 |
| 2.309999999999952 | 8.976 | 10.074 | 11.308 |
| 2.314999999999952 | 9.018 | 10.125 | 11.367 |
| 2.319999999999952 | 9.061 | 10.176 | 11.427 |
| 2.324999999999952 | 9.104 | 10.227 | 11.487 |
| 2.329999999999952 | 9.148 | 10.278 | 11.548 |
| 2.334999999999952 | 9.191 | 10.329 | 11.609 |
| 2.339999999999952 | 9.235 | 10.381 | 11.67 |
| 2.344999999999952 | 9.279 | 10.433 | 11.731 |
| 2.349999999999952 | 9.323 | 10.486 | 11.793 |
| 2.354999999999952 | 9.368 | 10.538 | 11.855 |
| 2.359999999999951 | 9.412 | 10.591 | 11.917 |
| 2.364999999999951 | 9.457 | 10.644 | 11.98 |
| 2.369999999999951 | 9.502 | 10.697 | 12.043 |
| 2.374999999999951 | 9.547 | 10.751 | 12.107 |
| 2.379999999999951 | 9.593 | 10.805 | 12.17 |
| 2.384999999999951 | 9.638 | 10.859 | 12.234 |
| 2.389999999999951 | 9.684 | 10.913 | 12.299 |
| 2.394999999999951 | 9.73 | 10.968 | 12.364 |
| 2.399999999999951 | 9.777 | 11.023 | 12.429 |
| 2.40499999999995 | 9.823 | 11.078 | 12.494 |
| 2.40999999999995 | 9.87 | 11.134 | 12.56 |
| 2.41499999999995 | 9.917 | 11.19 | 12.626 |
| 2.41999999999995 | 9.964 | 11.246 | 12.692 |
| 2.42499999999995 | 10.012 | 11.302 | 12.759 |
| 2.42999999999995 | 10.059 | 11.359 | 12.826 |
| 2.43499999999995 | 10.107 | 11.416 | 12.894 |
| 2.43999999999995 | 10.155 | 11.473 | 12.962 |
| 2.44499999999995 | 10.204 | 11.531 | 13.03 |
| 2.44999999999995 | 10.252 | 11.588 | 13.099 |
| 2.454999999999949 | 10.301 | 11.646 | 13.167 |
| 2.459999999999949 | 10.35 | 11.705 | 13.237 |
| 2.464999999999949 | 10.399 | 11.763 | 13.306 |
| 2.469999999999949 | 10.449 | 11.822 | 13.377 |
| 2.474999999999949 | 10.499 | 11.882 | 13.447 |
| 2.479999999999949 | 10.549 | 11.941 | 13.518 |
| 2.484999999999949 | 10.599 | 12.001 | 13.589 |
| 2.489999999999949 | 10.649 | 12.061 | 13.66 |
| 2.494999999999949 | 10.7 | 12.122 | 13.732 |
| 2.499999999999948 | 10.751 | 12.182 | 13.805 |
| 2.504999999999948 | 10.802 | 12.244 | 13.877 |
| 2.509999999999948 | 10.854 | 12.305 | 13.95 |
| 2.514999999999948 | 10.905 | 12.367 | 14.024 |
| 2.519999999999948 | 10.957 | 12.429 | 14.098 |
| 2.524999999999948 | 11.009 | 12.491 | 14.172 |
| 2.529999999999948 | 11.062 | 12.554 | 14.246 |
| 2.534999999999948 | 11.114 | 12.616 | 14.321 |
| 2.539999999999948 | 11.167 | 12.68 | 14.397 |
| 2.544999999999948 | 11.221 | 12.743 | 14.472 |
| 2.549999999999947 | 11.274 | 12.807 | 14.549 |
| 2.554999999999947 | 11.328 | 12.871 | 14.625 |
| 2.559999999999947 | 11.382 | 12.936 | 14.702 |
| 2.564999999999947 | 11.436 | 13.001 | 14.78 |
| 2.569999999999947 | 11.49 | 13.066 | 14.857 |
| 2.574999999999947 | 11.545 | 13.131 | 14.936 |
| 2.579999999999947 | 11.6 | 13.197 | 15.014 |
| 2.584999999999947 | 11.655 | 13.263 | 15.093 |
| 2.589999999999947 | 11.711 | 13.33 | 15.173 |
| 2.594999999999946 | 11.766 | 13.397 | 15.253 |
| 2.599999999999946 | 11.822 | 13.464 | 15.333 |
| 2.604999999999946 | 11.879 | 13.531 | 15.414 |
| 2.609999999999946 | 11.935 | 13.599 | 15.495 |
| 2.614999999999946 | 11.992 | 13.667 | 15.576 |
| 2.619999999999946 | 12.049 | 13.736 | 15.658 |
| 2.624999999999946 | 12.107 | 13.805 | 15.741 |
| 2.629999999999946 | 12.164 | 13.874 | 15.824 |
| 2.634999999999946 | 12.222 | 13.943 | 15.907 |
| 2.639999999999945 | 12.28 | 14.013 | 15.991 |
| 2.644999999999945 | 12.339 | 14.083 | 16.075 |
| 2.649999999999945 | 12.398 | 14.154 | 16.159 |
| 2.654999999999945 | 12.457 | 14.225 | 16.244 |
| 2.659999999999945 | 12.516 | 14.296 | 16.33 |
| 2.664999999999945 | 12.575 | 14.368 | 16.416 |
| 2.669999999999945 | 12.635 | 14.44 | 16.502 |
| 2.674999999999945 | 12.696 | 14.512 | 16.589 |
| 2.679999999999945 | 12.756 | 14.585 | 16.676 |
| 2.684999999999944 | 12.817 | 14.658 | 16.764 |
| 2.689999999999944 | 12.878 | 14.732 | 16.853 |
| 2.694999999999944 | 12.939 | 14.806 | 16.941 |
| 2.699999999999944 | 13.001 | 14.88 | 17.03 |
| 2.704999999999944 | 13.063 | 14.954 | 17.12 |
| 2.709999999999944 | 13.125 | 15.029 | 17.21 |
| 2.714999999999944 | 13.187 | 15.105 | 17.301 |
| 2.719999999999944 | 13.25 | 15.18 | 17.392 |
| 2.724999999999944 | 13.313 | 15.256 | 17.483 |
| 2.729999999999944 | 13.377 | 15.333 | 17.575 |
| 2.734999999999943 | 13.44 | 15.41 | 17.668 |
| 2.739999999999943 | 13.504 | 15.487 | 17.761 |
| 2.744999999999943 | 13.568 | 15.565 | 17.854 |
| 2.749999999999943 | 13.633 | 15.643 | 17.948 |
| 2.754999999999943 | 13.698 | 15.721 | 18.043 |
| 2.759999999999943 | 13.763 | 15.8 | 18.138 |
| 2.764999999999943 | 13.829 | 15.879 | 18.233 |
| 2.769999999999943 | 13.895 | 15.959 | 18.329 |
| 2.774999999999943 | 13.961 | 16.039 | 18.426 |
| 2.779999999999942 | 14.027 | 16.119 | 18.523 |
| 2.784999999999942 | 14.094 | 16.2 | 18.62 |
| 2.789999999999942 | 14.161 | 16.281 | 18.718 |
| 2.794999999999942 | 14.229 | 16.363 | 18.817 |
| 2.799999999999942 | 14.296 | 16.445 | 18.916 |
| 2.804999999999942 | 14.364 | 16.527 | 19.015 |
| 2.809999999999942 | 14.433 | 16.61 | 19.116 |
| 2.814999999999942 | 14.501 | 16.693 | 19.216 |
| 2.819999999999942 | 14.571 | 16.777 | 19.317 |
| 2.824999999999942 | 14.64 | 16.861 | 19.419 |
| 2.829999999999941 | 14.71 | 16.945 | 19.521 |
| 2.834999999999941 | 14.78 | 17.03 | 19.624 |
| 2.839999999999941 | 14.85 | 17.116 | 19.727 |
| 2.844999999999941 | 14.921 | 17.202 | 19.831 |
| 2.849999999999941 | 14.992 | 17.288 | 19.935 |
| 2.854999999999941 | 15.063 | 17.374 | 20.04 |
| 2.859999999999941 | 15.135 | 17.462 | 20.146 |
| 2.864999999999941 | 15.207 | 17.549 | 20.252 |
| 2.869999999999941 | 15.279 | 17.637 | 20.359 |
| 2.87499999999994 | 15.352 | 17.725 | 20.466 |
| 2.87999999999994 | 15.425 | 17.814 | 20.573 |
| 2.88499999999994 | 15.499 | 17.904 | 20.682 |
| 2.88999999999994 | 15.572 | 17.993 | 20.791 |
| 2.89499999999994 | 15.647 | 18.084 | 20.9 |
| 2.89999999999994 | 15.721 | 18.174 | 21.01 |
| 2.90499999999994 | 15.796 | 18.265 | 21.121 |
| 2.90999999999994 | 15.871 | 18.357 | 21.232 |
| 2.91499999999994 | 15.947 | 18.449 | 21.344 |
| 2.91999999999994 | 16.023 | 18.541 | 21.456 |
| 2.924999999999939 | 16.099 | 18.634 | 21.569 |
| 2.929999999999939 | 16.176 | 18.728 | 21.682 |
| 2.934999999999939 | 16.253 | 18.822 | 21.797 |
| 2.939999999999939 | 16.33 | 18.916 | 21.911 |
| 2.944999999999939 | 16.408 | 19.011 | 22.027 |
| 2.949999999999939 | 16.486 | 19.106 | 22.143 |
| 2.954999999999939 | 16.564 | 19.202 | 22.259 |
| 2.959999999999939 | 16.643 | 19.298 | 22.376 |
| 2.964999999999939 | 16.722 | 19.395 | 22.494 |
| 2.969999999999938 | 16.802 | 19.492 | 22.612 |
| 2.974999999999938 | 16.882 | 19.59 | 22.731 |
| 2.979999999999938 | 16.962 | 19.688 | 22.851 |
| 2.984999999999938 | 17.043 | 19.787 | 22.971 |
| 2.989999999999938 | 17.124 | 19.886 | 23.092 |
| 2.994999999999938 | 17.206 | 19.985 | 23.214 |
| 2.999999999999938 | 17.288 | 20.086 | 23.336 |
| 3.004999999999938 | 17.37 | 20.186 | 23.459 |
| 3.009999999999938 | 17.453 | 20.287 | 23.582 |
| 3.014999999999938 | 17.536 | 20.389 | 23.707 |
| 3.019999999999937 | 17.619 | 20.491 | 23.831 |
| 3.024999999999937 | 17.703 | 20.594 | 23.957 |
| 3.029999999999937 | 17.788 | 20.697 | 24.083 |
| 3.034999999999937 | 17.872 | 20.801 | 24.21 |
| 3.039999999999937 | 17.957 | 20.905 | 24.337 |
| 3.044999999999937 | 18.043 | 21.01 | 24.465 |
| 3.049999999999937 | 18.129 | 21.115 | 24.594 |
| 3.054999999999937 | 18.215 | 21.221 | 24.723 |
| 3.059999999999937 | 18.302 | 21.328 | 24.854 |
| 3.064999999999936 | 18.389 | 21.434 | 24.984 |
| 3.069999999999936 | 18.477 | 21.542 | 25.116 |
| 3.074999999999936 | 18.564 | 21.65 | 25.248 |
| 3.079999999999936 | 18.653 | 21.758 | 25.381 |
| 3.084999999999936 | 18.742 | 21.867 | 25.515 |
| 3.089999999999936 | 18.831 | 21.977 | 25.649 |
| 3.094999999999936 | 18.921 | 22.087 | 25.784 |
| 3.099999999999936 | 19.011 | 22.198 | 25.92 |
| 3.104999999999936 | 19.101 | 22.309 | 26.056 |
| 3.109999999999935 | 19.192 | 22.421 | 26.193 |
| 3.114999999999935 | 19.284 | 22.533 | 26.331 |
| 3.119999999999935 | 19.375 | 22.646 | 26.47 |
| 3.124999999999935 | 19.468 | 22.76 | 26.609 |
| 3.129999999999935 | 19.56 | 22.874 | 26.749 |
| 3.134999999999935 | 19.653 | 22.989 | 26.89 |
| 3.139999999999935 | 19.747 | 23.104 | 27.031 |
| 3.144999999999935 | 19.841 | 23.22 | 27.174 |
| 3.149999999999935 | 19.935 | 23.336 | 27.317 |
| 3.154999999999935 | 20.03 | 23.453 | 27.461 |
| 3.159999999999934 | 20.126 | 23.571 | 27.605 |
| 3.164999999999934 | 20.222 | 23.689 | 27.75 |
| 3.169999999999934 | 20.318 | 23.807 | 27.896 |
| 3.174999999999934 | 20.415 | 23.927 | 28.043 |
| 3.179999999999934 | 20.512 | 24.047 | 28.191 |
| 3.184999999999934 | 20.609 | 24.167 | 28.339 |
| 3.189999999999934 | 20.708 | 24.288 | 28.488 |
| 3.194999999999934 | 20.806 | 24.41 | 28.638 |
| 3.199999999999934 | 20.905 | 24.533 | 28.789 |
| 3.204999999999933 | 21.005 | 24.656 | 28.941 |
| 3.209999999999933 | 21.105 | 24.779 | 29.093 |
| 3.214999999999933 | 21.205 | 24.903 | 29.246 |
| 3.219999999999933 | 21.306 | 25.028 | 29.4 |
| 3.224999999999933 | 21.408 | 25.154 | 29.555 |
| 3.229999999999933 | 21.51 | 25.28 | 29.71 |
| 3.234999999999933 | 21.612 | 25.406 | 29.867 |
| 3.239999999999933 | 21.715 | 25.534 | 30.024 |
| 3.244999999999932 | 21.818 | 25.662 | 30.182 |
| 3.249999999999932 | 21.922 | 25.79 | 30.341 |
| 3.254999999999932 | 22.027 | 25.92 | 30.501 |
| 3.259999999999932 | 22.131 | 26.05 | 30.661 |
| 3.264999999999932 | 22.237 | 26.18 | 30.823 |
| 3.269999999999932 | 22.343 | 26.311 | 30.985 |
| 3.274999999999932 | 22.449 | 26.443 | 31.148 |
| 3.279999999999932 | 22.556 | 26.576 | 31.312 |
| 3.284999999999932 | 22.663 | 26.709 | 31.477 |
| 3.289999999999932 | 22.771 | 26.843 | 31.642 |
| 3.294999999999932 | 22.88 | 26.977 | 31.809 |
| 3.299999999999931 | 22.989 | 27.113 | 31.976 |
| 3.304999999999931 | 23.098 | 27.249 | 32.145 |
| 3.309999999999931 | 23.208 | 27.385 | 32.314 |
| 3.314999999999931 | 23.319 | 27.522 | 32.484 |
| 3.319999999999931 | 23.43 | 27.66 | 32.655 |
| 3.324999999999931 | 23.541 | 27.799 | 32.827 |
| 3.329999999999931 | 23.653 | 27.938 | 33 |
| 3.334999999999931 | 23.766 | 28.078 | 33.173 |
| 3.339999999999931 | 23.879 | 28.219 | 33.348 |
| 3.34499999999993 | 23.993 | 28.361 | 33.524 |
| 3.34999999999993 | 24.107 | 28.503 | 33.7 |
| 3.35499999999993 | 24.222 | 28.646 | 33.877 |
| 3.35999999999993 | 24.337 | 28.789 | 34.056 |
| 3.36499999999993 | 24.453 | 28.933 | 34.235 |
| 3.36999999999993 | 24.569 | 29.079 | 34.415 |
| 3.37499999999993 | 24.686 | 29.224 | 34.596 |
| 3.37999999999993 | 24.804 | 29.371 | 34.779 |
| 3.38499999999993 | 24.922 | 29.518 | 34.962 |
| 3.389999999999929 | 25.041 | 29.666 | 35.146 |
| 3.394999999999929 | 25.16 | 29.815 | 35.331 |
| 3.399999999999929 | 25.28 | 29.964 | 35.517 |
| 3.404999999999929 | 25.4 | 30.114 | 35.704 |
| 3.409999999999929 | 25.521 | 30.265 | 35.891 |
| 3.414999999999929 | 25.642 | 30.417 | 36.08 |
| 3.419999999999929 | 25.765 | 30.569 | 36.27 |
| 3.424999999999929 | 25.887 | 30.723 | 36.461 |
| 3.429999999999929 | 26.01 | 30.877 | 36.653 |
| 3.434999999999929 | 26.134 | 31.031 | 36.846 |
| 3.439999999999928 | 26.259 | 31.187 | 37.04 |
| 3.444999999999928 | 26.384 | 31.343 | 37.235 |
| 3.449999999999928 | 26.509 | 31.5 | 37.431 |
| 3.454999999999928 | 26.636 | 31.658 | 37.628 |
| 3.459999999999928 | 26.762 | 31.817 | 37.826 |
| 3.464999999999928 | 26.89 | 31.976 | 38.025 |
| 3.469999999999928 | 27.018 | 32.137 | 38.225 |
| 3.474999999999928 | 27.147 | 32.298 | 38.427 |
| 3.479999999999928 | 27.276 | 32.46 | 38.629 |
| 3.484999999999927 | 27.406 | 32.622 | 38.832 |
| 3.489999999999927 | 27.536 | 32.786 | 39.037 |
| 3.494999999999927 | 27.667 | 32.95 | 39.242 |
| 3.499999999999927 | 27.799 | 33.115 | 39.449 |
| 3.504999999999927 | 27.931 | 33.281 | 39.656 |
| 3.509999999999927 | 28.064 | 33.448 | 39.865 |
| 3.514999999999927 | 28.198 | 33.616 | 40.075 |
| 3.519999999999927 | 28.332 | 33.784 | 40.286 |
| 3.524999999999927 | 28.467 | 33.954 | 40.498 |
| 3.529999999999927 | 28.603 | 34.124 | 40.711 |
| 3.534999999999926 | 28.739 | 34.295 | 40.925 |
| 3.539999999999926 | 28.876 | 34.467 | 41.141 |
| 3.544999999999926 | 29.013 | 34.64 | 41.357 |
| 3.549999999999926 | 29.151 | 34.813 | 41.575 |
| 3.554999999999926 | 29.29 | 34.988 | 41.794 |
| 3.559999999999926 | 29.43 | 35.163 | 42.014 |
| 3.564999999999926 | 29.57 | 35.339 | 42.235 |
| 3.569999999999926 | 29.71 | 35.517 | 42.457 |
| 3.574999999999926 | 29.852 | 35.695 | 42.681 |
| 3.579999999999925 | 29.994 | 35.874 | 42.905 |
| 3.584999999999925 | 30.137 | 36.053 | 43.131 |
| 3.589999999999925 | 30.28 | 36.234 | 43.358 |
| 3.594999999999925 | 30.425 | 36.416 | 43.587 |
| 3.599999999999925 | 30.569 | 36.598 | 43.816 |
| 3.604999999999925 | 30.715 | 36.782 | 44.047 |
| 3.609999999999925 | 30.861 | 36.966 | 44.279 |
| 3.614999999999925 | 31.008 | 37.151 | 44.512 |
| 3.619999999999925 | 31.156 | 37.338 | 44.746 |
| 3.624999999999924 | 31.304 | 37.525 | 44.981 |
| 3.629999999999924 | 31.453 | 37.713 | 45.218 |
| 3.634999999999924 | 31.603 | 37.902 | 45.456 |
| 3.639999999999924 | 31.753 | 38.092 | 45.696 |
| 3.644999999999924 | 31.905 | 38.283 | 45.936 |
| 3.649999999999924 | 32.057 | 38.475 | 46.178 |
| 3.654999999999924 | 32.209 | 38.668 | 46.421 |
| 3.659999999999924 | 32.362 | 38.861 | 46.665 |
| 3.664999999999924 | 32.517 | 39.056 | 46.911 |
| 3.669999999999923 | 32.671 | 39.252 | 47.158 |
| 3.674999999999923 | 32.827 | 39.449 | 47.406 |
| 3.679999999999923 | 32.983 | 39.646 | 47.656 |
| 3.684999999999923 | 33.14 | 39.845 | 47.906 |
| 3.689999999999923 | 33.298 | 40.045 | 48.159 |
| 3.694999999999923 | 33.457 | 40.246 | 48.412 |
| 3.699999999999923 | 33.616 | 40.447 | 48.667 |
| 3.704999999999923 | 33.776 | 40.65 | 48.923 |
| 3.709999999999923 | 33.937 | 40.854 | 49.181 |
| 3.714999999999923 | 34.098 | 41.059 | 49.44 |
| 3.719999999999922 | 34.261 | 41.264 | 49.7 |
| 3.724999999999922 | 34.424 | 41.471 | 49.961 |
| 3.729999999999922 | 34.588 | 41.679 | 50.224 |
| 3.734999999999922 | 34.752 | 41.888 | 50.489 |
| 3.739999999999922 | 34.918 | 42.098 | 50.754 |
| 3.744999999999922 | 35.084 | 42.309 | 51.022 |
| 3.749999999999922 | 35.251 | 42.521 | 51.29 |
| 3.754999999999922 | 35.419 | 42.734 | 51.56 |
| 3.759999999999922 | 35.588 | 42.948 | 51.832 |
| 3.764999999999921 | 35.757 | 43.164 | 52.104 |
| 3.769999999999921 | 35.927 | 43.38 | 52.379 |
| 3.774999999999921 | 36.098 | 43.598 | 52.654 |
| 3.779999999999921 | 36.27 | 43.816 | 52.932 |
| 3.784999999999921 | 36.443 | 44.036 | 53.21 |
| 3.789999999999921 | 36.617 | 44.256 | 53.49 |
| 3.794999999999921 | 36.791 | 44.478 | 53.772 |
| 3.799999999999921 | 36.966 | 44.701 | 54.055 |
| 3.804999999999921 | 37.142 | 44.925 | 54.339 |
| 3.809999999999921 | 37.319 | 45.15 | 54.625 |
| 3.81499999999992 | 37.497 | 45.377 | 54.913 |
| 3.81999999999992 | 37.675 | 45.604 | 55.202 |
| 3.82499999999992 | 37.855 | 45.833 | 55.493 |
| 3.82999999999992 | 38.035 | 46.063 | 55.785 |
| 3.83499999999992 | 38.216 | 46.293 | 56.078 |
| 3.83999999999992 | 38.398 | 46.525 | 56.374 |
| 3.84499999999992 | 38.581 | 46.759 | 56.67 |
| 3.84999999999992 | 38.764 | 46.993 | 56.969 |
| 3.85499999999992 | 38.949 | 47.229 | 57.268 |
| 3.859999999999919 | 39.134 | 47.465 | 57.57 |
| 3.864999999999919 | 39.321 | 47.703 | 57.873 |
| 3.869999999999919 | 39.508 | 47.942 | 58.178 |
| 3.874999999999919 | 39.696 | 48.183 | 58.484 |
| 3.879999999999919 | 39.885 | 48.424 | 58.792 |
| 3.884999999999919 | 40.075 | 48.667 | 59.101 |
| 3.889999999999919 | 40.266 | 48.911 | 59.412 |
| 3.894999999999919 | 40.457 | 49.156 | 59.725 |
| 3.899999999999919 | 40.65 | 49.402 | 60.039 |
| 3.904999999999919 | 40.844 | 49.65 | 60.355 |
| 3.909999999999918 | 41.038 | 49.899 | 60.673 |
| 3.914999999999918 | 41.233 | 50.149 | 60.992 |
| 3.919999999999918 | 41.43 | 50.4 | 61.313 |
| 3.924999999999918 | 41.627 | 50.653 | 61.636 |
| 3.929999999999918 | 41.825 | 50.907 | 61.961 |
| 3.934999999999918 | 42.024 | 51.162 | 62.287 |
| 3.939999999999918 | 42.224 | 51.419 | 62.615 |
| 3.944999999999918 | 42.426 | 51.676 | 62.944 |
| 3.949999999999918 | 42.628 | 51.935 | 63.276 |
| 3.954999999999917 | 42.83 | 52.196 | 63.609 |
| 3.959999999999917 | 43.034 | 52.457 | 63.944 |
| 3.964999999999917 | 43.239 | 52.72 | 64.28 |
| 3.969999999999917 | 43.445 | 52.985 | 64.618 |
| 3.974999999999917 | 43.652 | 53.25 | 64.959 |
| 3.979999999999917 | 43.86 | 53.517 | 65.301 |
| 3.984999999999917 | 44.069 | 53.785 | 65.644 |
| 3.989999999999917 | 44.279 | 54.055 | 65.99 |
| 3.994999999999917 | 44.489 | 54.326 | 66.337 |
| 3.999999999999916 | 44.701 | 54.598 | 66.686 |
| 4.004999999999916 | 44.914 | 54.872 | 67.037 |
| 4.009999999999916 | 45.128 | 55.147 | 67.39 |
| 4.014999999999916 | 45.343 | 55.423 | 67.745 |
| 4.019999999999916 | 45.559 | 55.701 | 68.102 |
| 4.024999999999916 | 45.776 | 55.98 | 68.46 |
| 4.029999999999916 | 45.993 | 56.261 | 68.82 |
| 4.034999999999916 | 46.212 | 56.543 | 69.183 |
| 4.039999999999915 | 46.433 | 56.826 | 69.547 |
| 4.044999999999916 | 46.654 | 57.111 | 69.913 |
| 4.049999999999915 | 46.876 | 57.397 | 70.281 |
| 4.054999999999915 | 47.099 | 57.685 | 70.651 |
| 4.059999999999915 | 47.323 | 57.974 | 71.023 |
| 4.064999999999915 | 47.548 | 58.265 | 71.397 |
| 4.069999999999915 | 47.775 | 58.557 | 71.772 |
| 4.074999999999915 | 48.002 | 58.85 | 72.15 |
| 4.079999999999914 | 48.231 | 59.145 | 72.53 |
| 4.084999999999915 | 48.461 | 59.442 | 72.912 |
| 4.089999999999914 | 48.691 | 59.74 | 73.296 |
| 4.094999999999914 | 48.923 | 60.039 | 73.681 |
| 4.099999999999914 | 49.156 | 60.34 | 74.069 |
| 4.104999999999914 | 49.39 | 60.643 | 74.459 |
| 4.109999999999914 | 49.625 | 60.947 | 74.851 |
| 4.114999999999914 | 49.862 | 61.252 | 75.245 |
| 4.119999999999914 | 50.099 | 61.559 | 75.641 |
| 4.124999999999914 | 50.337 | 61.868 | 76.039 |
| 4.129999999999914 | 50.577 | 62.178 | 76.44 |
| 4.134999999999914 | 50.818 | 62.49 | 76.842 |
| 4.139999999999914 | 51.06 | 62.803 | 77.246 |
| 4.144999999999913 | 51.303 | 63.118 | 77.653 |
| 4.149999999999913 | 51.547 | 63.434 | 78.062 |
| 4.154999999999913 | 51.793 | 63.752 | 78.473 |
| 4.159999999999913 | 52.039 | 64.072 | 78.886 |
| 4.164999999999913 | 52.287 | 64.393 | 79.301 |
| 4.169999999999913 | 52.536 | 64.715 | 79.718 |
| 4.174999999999913 | 52.786 | 65.04 | 80.138 |
| 4.179999999999913 | 53.038 | 65.366 | 80.56 |
| 4.184999999999913 | 53.29 | 65.694 | 80.984 |
| 4.189999999999912 | 53.544 | 66.023 | 81.41 |
| 4.194999999999912 | 53.799 | 66.354 | 81.839 |
| 4.199999999999912 | 54.055 | 66.686 | 82.269 |
| 4.204999999999912 | 54.312 | 67.021 | 82.703 |
| 4.209999999999912 | 54.571 | 67.357 | 83.138 |
| 4.214999999999912 | 54.831 | 67.694 | 83.575 |
| 4.219999999999912 | 55.092 | 68.033 | 84.015 |
| 4.224999999999912 | 55.354 | 68.375 | 84.458 |
| 4.229999999999912 | 55.618 | 68.717 | 84.902 |
| 4.234999999999911 | 55.882 | 69.062 | 85.349 |
| 4.239999999999911 | 56.149 | 69.408 | 85.798 |
| 4.244999999999911 | 56.416 | 69.756 | 86.25 |
| 4.249999999999911 | 56.684 | 70.105 | 86.704 |
| 4.254999999999911 | 56.954 | 70.457 | 87.16 |
| 4.259999999999911 | 57.226 | 70.81 | 87.619 |
| 4.264999999999911 | 57.498 | 71.165 | 88.08 |
| 4.269999999999911 | 57.772 | 71.522 | 88.544 |
| 4.274999999999911 | 58.047 | 71.88 | 89.01 |
| 4.27999999999991 | 58.323 | 72.24 | 89.479 |
| 4.28499999999991 | 58.601 | 72.603 | 89.95 |
| 4.28999999999991 | 58.88 | 72.966 | 90.423 |
| 4.29499999999991 | 59.16 | 73.332 | 90.899 |
| 4.29999999999991 | 59.442 | 73.7 | 91.378 |
| 4.30499999999991 | 59.725 | 74.069 | 91.859 |
| 4.30999999999991 | 60.009 | 74.44 | 92.342 |
| 4.31499999999991 | 60.295 | 74.814 | 92.828 |
| 4.31999999999991 | 60.582 | 75.189 | 93.317 |
| 4.32499999999991 | 60.871 | 75.566 | 93.808 |
| 4.329999999999909 | 61.16 | 75.944 | 94.302 |
| 4.334999999999909 | 61.452 | 76.325 | 94.798 |
| 4.33999999999991 | 61.744 | 76.708 | 95.297 |
| 4.344999999999909 | 62.038 | 77.092 | 95.799 |
| 4.349999999999909 | 62.334 | 77.478 | 96.303 |
| 4.354999999999909 | 62.63 | 77.867 | 96.81 |
| 4.359999999999909 | 62.929 | 78.257 | 97.32 |
| 4.364999999999909 | 63.228 | 78.649 | 97.832 |
| 4.369999999999909 | 63.529 | 79.044 | 98.347 |
| 4.374999999999908 | 63.832 | 79.44 | 98.864 |
| 4.379999999999908 | 64.136 | 79.838 | 99.385 |
| 4.384999999999908 | 64.441 | 80.238 | 99.908 |
| 4.389999999999908 | 64.748 | 80.64 | 100.434 |
| 4.394999999999908 | 65.056 | 81.045 | 100.963 |
| 4.399999999999908 | 65.366 | 81.451 | 101.494 |
| 4.404999999999908 | 65.677 | 81.859 | 102.028 |
| 4.409999999999907 | 65.99 | 82.269 | 102.565 |
| 4.414999999999908 | 66.304 | 82.682 | 103.105 |
| 4.419999999999907 | 66.62 | 83.096 | 103.648 |
| 4.424999999999907 | 66.937 | 83.513 | 104.194 |
| 4.429999999999907 | 67.256 | 83.931 | 104.742 |
| 4.434999999999907 | 67.576 | 84.352 | 105.293 |
| 4.439999999999907 | 67.898 | 84.775 | 105.848 |
| 4.444999999999907 | 68.221 | 85.2 | 106.405 |
| 4.449999999999906 | 68.546 | 85.627 | 106.965 |
| 4.454999999999907 | 68.872 | 86.056 | 107.528 |
| 4.459999999999906 | 69.2 | 86.488 | 108.094 |
| 4.464999999999907 | 69.529 | 86.921 | 108.663 |
| 4.469999999999906 | 69.86 | 87.357 | 109.235 |
| 4.474999999999906 | 70.193 | 87.795 | 109.81 |
| 4.479999999999906 | 70.527 | 88.235 | 110.388 |
| 4.484999999999906 | 70.863 | 88.677 | 110.969 |
| 4.489999999999906 | 71.201 | 89.121 | 111.553 |
| 4.494999999999906 | 71.54 | 89.568 | 112.14 |
| 4.499999999999905 | 71.88 | 90.017 | 112.73 |
| 4.504999999999906 | 72.222 | 90.468 | 113.324 |
| 4.509999999999905 | 72.566 | 90.922 | 113.92 |
| 4.514999999999906 | 72.912 | 91.378 | 114.52 |
| 4.519999999999905 | 73.259 | 91.836 | 115.123 |
| 4.524999999999905 | 73.608 | 92.296 | 115.729 |
| 4.529999999999905 | 73.958 | 92.759 | 116.338 |
| 4.534999999999905 | 74.31 | 93.224 | 116.95 |
| 4.539999999999904 | 74.664 | 93.691 | 117.566 |
| 4.544999999999905 | 75.02 | 94.16 | 118.185 |
| 4.549999999999904 | 75.377 | 94.632 | 118.807 |
| 4.554999999999905 | 75.736 | 95.107 | 119.432 |
| 4.559999999999904 | 76.096 | 95.583 | 120.061 |
| 4.564999999999904 | 76.459 | 96.063 | 120.693 |
| 4.569999999999904 | 76.823 | 96.544 | 121.328 |
| 4.574999999999904 | 77.188 | 97.028 | 121.967 |
| 4.579999999999904 | 77.556 | 97.514 | 122.609 |
| 4.584999999999904 | 77.925 | 98.003 | 123.254 |
| 4.589999999999904 | 78.296 | 98.494 | 123.903 |
| 4.594999999999904 | 78.669 | 98.988 | 124.555 |
| 4.599999999999904 | 79.044 | 99.484 | 125.211 |
| 4.604999999999904 | 79.42 | 99.983 | 125.87 |
| 4.609999999999903 | 79.798 | 100.484 | 126.533 |
| 4.614999999999903 | 80.178 | 100.988 | 127.199 |
| 4.619999999999903 | 80.56 | 101.494 | 127.868 |
| 4.624999999999903 | 80.943 | 102.003 | 128.541 |
| 4.629999999999903 | 81.329 | 102.514 | 129.218 |
| 4.634999999999903 | 81.716 | 103.028 | 129.898 |
| 4.639999999999903 | 82.105 | 103.544 | 130.582 |
| 4.644999999999903 | 82.496 | 104.063 | 131.269 |
| 4.649999999999903 | 82.889 | 104.585 | 131.96 |
| 4.654999999999902 | 83.283 | 105.109 | 132.655 |
| 4.659999999999902 | 83.68 | 105.636 | 133.353 |
| 4.664999999999902 | 84.078 | 106.166 | 134.055 |
| 4.669999999999902 | 84.479 | 106.698 | 134.761 |
| 4.674999999999902 | 84.881 | 107.233 | 135.47 |
| 4.679999999999902 | 85.285 | 107.77 | 136.183 |
| 4.684999999999902 | 85.691 | 108.31 | 136.9 |
| 4.689999999999902 | 86.099 | 108.853 | 137.621 |
| 4.694999999999902 | 86.509 | 109.399 | 138.345 |
| 4.699999999999901 | 86.921 | 109.947 | 139.073 |
| 4.704999999999901 | 87.335 | 110.498 | 139.805 |
| 4.709999999999901 | 87.751 | 111.052 | 140.541 |
| 4.714999999999901 | 88.169 | 111.609 | 141.281 |
| 4.719999999999901 | 88.588 | 112.168 | 142.025 |
| 4.724999999999901 | 89.01 | 112.73 | 142.772 |
| 4.729999999999901 | 89.434 | 113.296 | 143.524 |
| 4.734999999999901 | 89.86 | 113.863 | 144.279 |
| 4.7399999999999 | 90.288 | 114.434 | 145.039 |
| 4.744999999999901 | 90.717 | 115.008 | 145.802 |
| 4.7499999999999 | 91.149 | 115.584 | 146.57 |
| 4.7549999999999 | 91.583 | 116.164 | 147.341 |
| 4.7599999999999 | 92.019 | 116.746 | 148.117 |
| 4.7649999999999 | 92.458 | 117.331 | 148.896 |
| 4.7699999999999 | 92.898 | 117.919 | 149.68 |
| 4.7749999999999 | 93.34 | 118.51 | 150.468 |
| 4.7799999999999 | 93.785 | 119.104 | 151.26 |
| 4.7849999999999 | 94.231 | 119.701 | 152.056 |
| 4.7899999999999 | 94.68 | 120.301 | 152.857 |
| 4.794999999999899 | 95.131 | 120.904 | 153.661 |
| 4.7999999999999 | 95.583 | 121.51 | 154.47 |
| 4.804999999999899 | 96.039 | 122.119 | 155.283 |
| 4.8099999999999 | 96.496 | 122.732 | 156.1 |
| 4.814999999999899 | 96.955 | 123.347 | 156.922 |
| 4.819999999999899 | 97.417 | 123.965 | 157.748 |
| 4.824999999999899 | 97.881 | 124.586 | 158.579 |
| 4.829999999999899 | 98.347 | 125.211 | 159.413 |
| 4.834999999999899 | 98.815 | 125.839 | 160.252 |
| 4.839999999999898 | 99.286 | 126.469 | 161.096 |
| 4.844999999999898 | 99.758 | 127.103 | 161.944 |
| 4.849999999999898 | 100.233 | 127.74 | 162.796 |
| 4.854999999999898 | 100.71 | 128.381 | 163.653 |
| 4.859999999999898 | 101.19 | 129.024 | 164.515 |
| 4.864999999999898 | 101.672 | 129.671 | 165.381 |
| 4.869999999999898 | 102.156 | 130.321 | 166.251 |
| 4.874999999999898 | 102.642 | 130.974 | 167.126 |
| 4.879999999999897 | 103.131 | 131.631 | 168.006 |
| 4.884999999999898 | 103.622 | 132.29 | 168.89 |
| 4.889999999999897 | 104.115 | 132.954 | 169.779 |
| 4.894999999999897 | 104.611 | 133.62 | 170.673 |
| 4.899999999999897 | 105.109 | 134.29 | 171.571 |
| 4.904999999999897 | 105.61 | 134.963 | 172.475 |
| 4.909999999999897 | 106.113 | 135.639 | 173.382 |
| 4.914999999999897 | 106.618 | 136.319 | 174.295 |
| 4.919999999999896 | 107.125 | 137.003 | 175.213 |
| 4.924999999999897 | 107.635 | 137.689 | 176.135 |
| 4.929999999999896 | 108.148 | 138.38 | 177.062 |
| 4.934999999999896 | 108.663 | 139.073 | 177.994 |
| 4.939999999999896 | 109.18 | 139.77 | 178.931 |
| 4.944999999999896 | 109.7 | 140.471 | 179.873 |
| 4.949999999999896 | 110.222 | 141.175 | 180.82 |
| 4.954999999999896 | 110.747 | 141.883 | 181.771 |
| 4.959999999999896 | 111.274 | 142.594 | 182.728 |
| 4.964999999999896 | 111.804 | 143.309 | 183.69 |
| 4.969999999999895 | 112.337 | 144.027 | 184.657 |
| 4.974999999999895 | 112.871 | 144.749 | 185.629 |
| 4.979999999999895 | 113.409 | 145.474 | 186.606 |
| 4.984999999999895 | 113.949 | 146.204 | 187.588 |
| 4.989999999999895 | 114.491 | 146.936 | 188.576 |
| 4.994999999999895 | 115.037 | 147.673 | 189.568 |
| 4.999999999999895 | 115.584 | 148.413 | 190.566 |
| 5.004999999999895 | 116.135 | 149.157 | 191.569 |
| 5.009999999999894 | 116.688 | 149.905 | 192.578 |
| 5.014999999999895 | 117.243 | 150.656 | 193.591 |
| 5.019999999999894 | 117.801 | 151.411 | 194.61 |
| 5.024999999999895 | 118.362 | 152.17 | 195.635 |
| 5.029999999999894 | 118.926 | 152.933 | 196.665 |
| 5.034999999999894 | 119.492 | 153.7 | 197.7 |
| 5.039999999999894 | 120.061 | 154.47 | 198.741 |
| 5.044999999999894 | 120.633 | 155.244 | 199.787 |
| 5.049999999999894 | 121.207 | 156.022 | 200.838 |
| 5.054999999999894 | 121.784 | 156.805 | 201.895 |
| 5.059999999999894 | 122.364 | 157.591 | 202.958 |
| 5.064999999999894 | 122.947 | 158.38 | 204.027 |
| 5.069999999999894 | 123.532 | 159.174 | 205.1 |
| 5.074999999999894 | 124.12 | 159.972 | 206.18 |
| 5.079999999999893 | 124.711 | 160.774 | 207.265 |
| 5.084999999999893 | 125.305 | 161.58 | 208.356 |
| 5.089999999999893 | 125.902 | 162.39 | 209.453 |
| 5.094999999999893 | 126.501 | 163.204 | 210.556 |
| 5.099999999999893 | 127.103 | 164.022 | 211.664 |
| 5.104999999999893 | 127.708 | 164.844 | 212.778 |
| 5.109999999999893 | 128.317 | 165.67 | 213.898 |
| 5.114999999999893 | 128.927 | 166.501 | 215.024 |
| 5.119999999999893 | 129.541 | 167.335 | 216.156 |
| 5.124999999999893 | 130.158 | 168.174 | 217.294 |
| 5.129999999999892 | 130.778 | 169.017 | 218.438 |
| 5.134999999999892 | 131.401 | 169.864 | 219.587 |
| 5.139999999999892 | 132.026 | 170.716 | 220.743 |
| 5.144999999999892 | 132.655 | 171.571 | 221.905 |
| 5.149999999999892 | 133.286 | 172.431 | 223.073 |
| 5.154999999999892 | 133.921 | 173.296 | 224.247 |
| 5.159999999999892 | 134.559 | 174.164 | 225.428 |
| 5.164999999999892 | 135.199 | 175.037 | 226.614 |
| 5.169999999999892 | 135.843 | 175.915 | 227.807 |
| 5.174999999999891 | 136.49 | 176.797 | 229.006 |
| 5.179999999999891 | 137.14 | 177.683 | 230.212 |
| 5.184999999999891 | 137.793 | 178.573 | 231.424 |
| 5.189999999999891 | 138.449 | 179.469 | 232.642 |
| 5.194999999999891 | 139.108 | 180.368 | 233.866 |
| 5.199999999999891 | 139.77 | 181.272 | 235.097 |
| 5.204999999999891 | 140.436 | 182.181 | 236.335 |
| 5.20999999999989 | 141.104 | 183.094 | 237.579 |
| 5.214999999999891 | 141.776 | 184.012 | 238.83 |
| 5.21999999999989 | 142.451 | 184.934 | 240.087 |
| 5.22499999999989 | 143.13 | 185.861 | 241.35 |
| 5.22999999999989 | 143.811 | 186.793 | 242.621 |
| 5.23499999999989 | 144.496 | 187.729 | 243.898 |
| 5.23999999999989 | 145.184 | 188.67 | 245.182 |
| 5.24499999999989 | 145.875 | 189.616 | 246.472 |
| 5.24999999999989 | 146.57 | 190.566 | 247.77 |
| 5.25499999999989 | 147.267 | 191.521 | 249.074 |
| 5.25999999999989 | 147.969 | 192.481 | 250.385 |
| 5.26499999999989 | 148.673 | 193.446 | 251.703 |
| 5.26999999999989 | 149.381 | 194.416 | 253.028 |
| 5.27499999999989 | 150.092 | 195.39 | 254.36 |
| 5.27999999999989 | 150.807 | 196.37 | 255.699 |
| 5.28499999999989 | 151.525 | 197.354 | 257.045 |
| 5.289999999999888 | 152.246 | 198.343 | 258.398 |
| 5.294999999999889 | 152.971 | 199.338 | 259.758 |
| 5.299999999999888 | 153.7 | 200.337 | 261.125 |
| 5.304999999999889 | 154.431 | 201.341 | 262.5 |
| 5.309999999999888 | 155.167 | 202.35 | 263.881 |
| 5.314999999999888 | 155.905 | 203.365 | 265.27 |
| 5.319999999999888 | 156.648 | 204.384 | 266.667 |
| 5.324999999999888 | 157.394 | 205.408 | 268.07 |
| 5.329999999999888 | 158.143 | 206.438 | 269.482 |
| 5.334999999999888 | 158.896 | 207.473 | 270.9 |
| 5.339999999999887 | 159.653 | 208.513 | 272.326 |
| 5.344999999999888 | 160.413 | 209.558 | 273.76 |
| 5.349999999999887 | 161.176 | 210.608 | 275.201 |
| 5.354999999999888 | 161.944 | 211.664 | 276.649 |
| 5.359999999999887 | 162.715 | 212.725 | 278.105 |
| 5.364999999999887 | 163.49 | 213.791 | 279.569 |
| 5.369999999999887 | 164.268 | 214.863 | 281.041 |
| 5.374999999999887 | 165.05 | 215.94 | 282.52 |
| 5.379999999999887 | 165.836 | 217.022 | 284.007 |
| 5.384999999999887 | 166.626 | 218.11 | 285.502 |
| 5.389999999999886 | 167.419 | 219.203 | 287.005 |
| 5.394999999999887 | 168.216 | 220.302 | 288.516 |
| 5.399999999999886 | 169.017 | 221.406 | 290.035 |
| 5.404999999999886 | 169.822 | 222.516 | 291.561 |
| 5.409999999999886 | 170.63 | 223.632 | 293.096 |
| 5.414999999999886 | 171.443 | 224.753 | 294.639 |
| 5.419999999999886 | 172.259 | 225.879 | 296.19 |
| 5.424999999999886 | 173.079 | 227.011 | 297.749 |
| 5.429999999999885 | 173.903 | 228.149 | 299.316 |
| 5.434999999999885 | 174.731 | 229.293 | 300.892 |
| 5.439999999999885 | 175.563 | 230.442 | 302.475 |
| 5.444999999999885 | 176.399 | 231.597 | 304.068 |
| 5.449999999999885 | 177.239 | 232.758 | 305.668 |
| 5.454999999999885 | 178.083 | 233.925 | 307.277 |
| 5.459999999999885 | 178.931 | 235.097 | 308.895 |
| 5.464999999999885 | 179.783 | 236.276 | 310.521 |
| 5.469999999999885 | 180.639 | 237.46 | 312.155 |
| 5.474999999999885 | 181.499 | 238.65 | 313.798 |
| 5.479999999999884 | 182.363 | 239.847 | 315.45 |
| 5.484999999999884 | 183.231 | 241.049 | 317.11 |
| 5.489999999999884 | 184.104 | 242.257 | 318.78 |
| 5.494999999999884 | 184.98 | 243.472 | 320.458 |
| 5.499999999999884 | 185.861 | 244.692 | 322.144 |
| 5.504999999999884 | 186.746 | 245.918 | 323.84 |
| 5.509999999999884 | 187.635 | 247.151 | 325.545 |
| 5.514999999999884 | 188.529 | 248.39 | 327.258 |
| 5.519999999999884 | 189.426 | 249.635 | 328.981 |
| 5.524999999999884 | 190.328 | 250.886 | 330.713 |
| 5.529999999999884 | 191.234 | 252.144 | 332.453 |
| 5.534999999999884 | 192.145 | 253.408 | 334.203 |
| 5.539999999999883 | 193.06 | 254.678 | 335.963 |
| 5.544999999999884 | 193.979 | 255.955 | 337.731 |
| 5.549999999999883 | 194.903 | 257.238 | 339.509 |
| 5.554999999999883 | 195.831 | 258.527 | 341.296 |
| 5.559999999999883 | 196.763 | 259.823 | 343.092 |
| 5.564999999999883 | 197.7 | 261.125 | 344.898 |
| 5.569999999999883 | 198.641 | 262.434 | 346.714 |
| 5.574999999999883 | 199.587 | 263.75 | 348.539 |
| 5.579999999999882 | 200.537 | 265.072 | 350.374 |
| 5.584999999999883 | 201.492 | 266.4 | 352.218 |
| 5.589999999999882 | 202.451 | 267.736 | 354.072 |
| 5.594999999999882 | 203.415 | 269.078 | 355.936 |
| 5.599999999999882 | 204.384 | 270.426 | 357.809 |
| 5.604999999999882 | 205.357 | 271.782 | 359.693 |
| 5.609999999999882 | 206.335 | 273.144 | 361.586 |
| 5.614999999999882 | 207.317 | 274.513 | 363.489 |
| 5.619999999999882 | 208.304 | 275.889 | 365.403 |
| 5.624999999999882 | 209.296 | 277.272 | 367.326 |
| 5.629999999999882 | 210.293 | 278.662 | 369.26 |
| 5.634999999999882 | 211.294 | 280.059 | 371.203 |
| 5.639999999999881 | 212.3 | 281.463 | 373.157 |
| 5.644999999999881 | 213.311 | 282.874 | 375.122 |
| 5.649999999999881 | 214.326 | 284.291 | 377.096 |
| 5.654999999999881 | 215.347 | 285.716 | 379.081 |
| 5.659999999999881 | 216.372 | 287.149 | 381.076 |
| 5.664999999999881 | 217.402 | 288.588 | 383.082 |
| 5.669999999999881 | 218.438 | 290.035 | 385.099 |
| 5.674999999999881 | 219.478 | 291.488 | 387.126 |
| 5.67999999999988 | 220.523 | 292.949 | 389.164 |
| 5.68499999999988 | 221.573 | 294.418 | 391.212 |
| 5.68999999999988 | 222.628 | 295.894 | 393.271 |
| 5.69499999999988 | 223.688 | 297.377 | 395.342 |
| 5.69999999999988 | 224.753 | 298.867 | 397.423 |
| 5.70499999999988 | 225.823 | 300.365 | 399.514 |
| 5.70999999999988 | 226.898 | 301.871 | 401.617 |
| 5.71499999999988 | 227.978 | 303.384 | 403.731 |
| 5.71999999999988 | 229.064 | 304.905 | 405.857 |
| 5.72499999999988 | 230.154 | 306.433 | 407.993 |
| 5.72999999999988 | 231.25 | 307.969 | 410.141 |
| 5.73499999999988 | 232.351 | 309.513 | 412.299 |
| 5.73999999999988 | 233.457 | 311.064 | 414.47 |
| 5.74499999999988 | 234.569 | 312.624 | 416.651 |
| 5.74999999999988 | 235.686 | 314.191 | 418.845 |
| 5.75499999999988 | 236.808 | 315.766 | 421.049 |
| 5.759999999999878 | 237.936 | 317.348 | 423.266 |
| 5.764999999999879 | 239.068 | 318.939 | 425.494 |
| 5.769999999999878 | 240.207 | 320.538 | 427.733 |
| 5.774999999999878 | 241.35 | 322.144 | 429.985 |
| 5.779999999999878 | 242.5 | 323.759 | 432.248 |
| 5.784999999999878 | 243.654 | 325.382 | 434.523 |
| 5.789999999999878 | 244.814 | 327.013 | 436.811 |
| 5.794999999999878 | 245.98 | 328.652 | 439.11 |
| 5.799999999999878 | 247.151 | 330.3 | 441.421 |
| 5.804999999999878 | 248.328 | 331.955 | 443.745 |
| 5.809999999999877 | 249.51 | 333.619 | 446.081 |
| 5.814999999999878 | 250.698 | 335.291 | 448.429 |
| 5.819999999999877 | 251.892 | 336.972 | 450.789 |
| 5.824999999999878 | 253.091 | 338.661 | 453.162 |
| 5.829999999999877 | 254.296 | 340.359 | 455.548 |
| 5.834999999999877 | 255.507 | 342.065 | 457.945 |
| 5.839999999999877 | 256.724 | 343.779 | 460.356 |
| 5.844999999999877 | 257.946 | 345.503 | 462.779 |
| 5.849999999999877 | 259.174 | 347.234 | 465.215 |
| 5.854999999999877 | 260.408 | 348.975 | 467.664 |
| 5.859999999999876 | 261.648 | 350.724 | 470.126 |
| 5.864999999999877 | 262.894 | 352.482 | 472.6 |
| 5.869999999999876 | 264.145 | 354.249 | 475.088 |
| 5.874999999999876 | 265.403 | 356.025 | 477.589 |
| 5.879999999999876 | 266.667 | 357.809 | 480.103 |
| 5.884999999999876 | 267.936 | 359.603 | 482.63 |
| 5.889999999999876 | 269.212 | 361.405 | 485.17 |
| 5.894999999999876 | 270.494 | 363.217 | 487.724 |
| 5.899999999999875 | 271.782 | 365.037 | 490.291 |
| 5.904999999999875 | 273.076 | 366.867 | 492.872 |
| 5.909999999999875 | 274.376 | 368.706 | 495.467 |
| 5.914999999999875 | 275.683 | 370.554 | 498.075 |
| 5.919999999999875 | 276.995 | 372.412 | 500.696 |
| 5.924999999999875 | 278.314 | 374.278 | 503.332 |
| 5.929999999999875 | 279.639 | 376.155 | 505.981 |
| 5.934999999999875 | 280.971 | 378.04 | 508.645 |
| 5.939999999999875 | 282.308 | 379.935 | 511.322 |
| 5.944999999999875 | 283.653 | 381.839 | 514.014 |
| 5.949999999999874 | 285.003 | 383.753 | 516.719 |
| 5.954999999999874 | 286.36 | 385.677 | 519.439 |
| 5.959999999999874 | 287.724 | 387.61 | 522.174 |
| 5.964999999999874 | 289.093 | 389.553 | 524.922 |
| 5.969999999999874 | 290.47 | 391.506 | 527.685 |
| 5.974999999999874 | 291.853 | 393.468 | 530.463 |
| 5.979999999999874 | 293.243 | 395.44 | 533.255 |
| 5.984999999999874 | 294.639 | 397.423 | 536.062 |
| 5.989999999999874 | 296.042 | 399.415 | 538.884 |
| 5.994999999999874 | 297.451 | 401.417 | 541.72 |
| 5.999999999999873 | 298.867 | 403.429 | 544.572 |
| 6.004999999999874 | 300.29 | 405.451 | 547.438 |
| 6.009999999999873 | 301.72 | 407.483 | 550.32 |
| 6.014999999999874 | 303.157 | 409.526 | 553.217 |
| 6.019999999999873 | 304.6 | 411.579 | 556.129 |
| 6.024999999999873 | 306.05 | 413.642 | 559.056 |
| 6.029999999999873 | 307.508 | 415.715 | 561.999 |
| 6.034999999999873 | 308.972 | 417.799 | 564.957 |
| 6.039999999999873 | 310.443 | 419.893 | 567.931 |
| 6.044999999999873 | 311.921 | 421.998 | 570.921 |
| 6.049999999999872 | 313.406 | 424.113 | 573.926 |
| 6.054999999999873 | 314.898 | 426.239 | 576.947 |
| 6.059999999999872 | 316.398 | 428.375 | 579.984 |
| 6.064999999999872 | 317.904 | 430.523 | 583.037 |
| 6.069999999999872 | 319.418 | 432.681 | 586.106 |
| 6.074999999999872 | 320.939 | 434.85 | 589.191 |
| 6.079999999999872 | 322.467 | 437.029 | 592.292 |
| 6.084999999999872 | 324.002 | 439.22 | 595.41 |
| 6.089999999999871 | 325.545 | 441.421 | 598.544 |
| 6.094999999999872 | 327.095 | 443.634 | 601.695 |
| 6.099999999999871 | 328.652 | 445.858 | 604.862 |
| 6.104999999999872 | 330.217 | 448.093 | 608.046 |
| 6.109999999999871 | 331.789 | 450.339 | 611.246 |
| 6.114999999999871 | 333.369 | 452.596 | 614.464 |
| 6.119999999999871 | 334.956 | 454.865 | 617.698 |
| 6.124999999999871 | 336.551 | 457.145 | 620.95 |
| 6.129999999999871 | 338.154 | 459.436 | 624.218 |
| 6.134999999999871 | 339.764 | 461.739 | 627.504 |
| 6.13999999999987 | 341.381 | 464.054 | 630.807 |
| 6.144999999999871 | 343.007 | 466.38 | 634.127 |
| 6.14999999999987 | 344.64 | 468.717 | 637.465 |
| 6.154999999999871 | 346.281 | 471.067 | 640.821 |
| 6.15999999999987 | 347.93 | 473.428 | 644.194 |
| 6.16499999999987 | 349.586 | 475.801 | 647.585 |
| 6.16999999999987 | 351.251 | 478.186 | 650.994 |
| 6.17499999999987 | 352.923 | 480.583 | 654.42 |
| 6.17999999999987 | 354.603 | 482.992 | 657.865 |
| 6.18499999999987 | 356.292 | 485.413 | 661.328 |
| 6.18999999999987 | 357.988 | 487.846 | 664.809 |
| 6.19499999999987 | 359.693 | 490.291 | 668.309 |
| 6.19999999999987 | 361.405 | 492.749 | 671.826 |
| 6.20499999999987 | 363.126 | 495.219 | 675.363 |
| 6.20999999999987 | 364.855 | 497.701 | 678.918 |
| 6.21499999999987 | 366.592 | 500.196 | 682.491 |
| 6.21999999999987 | 368.338 | 502.703 | 686.084 |
| 6.22499999999987 | 370.091 | 505.223 | 689.695 |
| 6.229999999999868 | 371.854 | 507.755 | 693.326 |
| 6.234999999999868 | 373.624 | 510.301 | 696.975 |
| 6.239999999999868 | 375.403 | 512.859 | 700.644 |
| 6.244999999999868 | 377.19 | 515.429 | 704.332 |
| 6.249999999999868 | 378.986 | 518.013 | 708.04 |
| 6.254999999999868 | 380.791 | 520.609 | 711.767 |
| 6.259999999999868 | 382.604 | 523.219 | 715.513 |
| 6.264999999999868 | 384.425 | 525.842 | 719.279 |
| 6.269999999999868 | 386.256 | 528.477 | 723.066 |
| 6.274999999999867 | 388.095 | 531.126 | 726.872 |
| 6.279999999999867 | 389.943 | 533.789 | 730.698 |
| 6.284999999999867 | 391.799 | 536.464 | 734.544 |
| 6.289999999999867 | 393.665 | 539.153 | 738.411 |
| 6.294999999999867 | 395.539 | 541.856 | 742.297 |
| 6.299999999999867 | 397.423 | 544.572 | 746.205 |
| 6.304999999999867 | 399.315 | 547.302 | 750.133 |
| 6.309999999999867 | 401.216 | 550.045 | 754.081 |
| 6.314999999999867 | 403.126 | 552.802 | 758.05 |
| 6.319999999999867 | 405.046 | 555.573 | 762.041 |
| 6.324999999999867 | 406.974 | 558.358 | 766.052 |
| 6.329999999999866 | 408.912 | 561.157 | 770.084 |
| 6.334999999999866 | 410.859 | 563.969 | 774.138 |
| 6.339999999999866 | 412.815 | 566.796 | 778.213 |
| 6.344999999999866 | 414.781 | 569.637 | 782.309 |
| 6.349999999999866 | 416.756 | 572.493 | 786.427 |
| 6.354999999999866 | 418.74 | 575.362 | 790.567 |
| 6.359999999999866 | 420.734 | 578.246 | 794.728 |
| 6.364999999999866 | 422.737 | 581.145 | 798.911 |
| 6.369999999999865 | 424.75 | 584.058 | 803.117 |
| 6.374999999999865 | 426.772 | 586.985 | 807.344 |
| 6.379999999999865 | 428.804 | 589.928 | 811.594 |
| 6.384999999999865 | 430.846 | 592.885 | 815.866 |
| 6.389999999999865 | 432.897 | 595.857 | 820.16 |
| 6.394999999999865 | 434.958 | 598.843 | 824.478 |
| 6.399999999999865 | 437.029 | 601.845 | 828.818 |
| 6.404999999999865 | 439.11 | 604.862 | 833.18 |
| 6.409999999999865 | 441.201 | 607.894 | 837.566 |
| 6.414999999999865 | 443.301 | 610.941 | 841.975 |
| 6.419999999999864 | 445.412 | 614.003 | 846.407 |
| 6.424999999999864 | 447.533 | 617.081 | 850.862 |
| 6.429999999999864 | 449.664 | 620.174 | 855.341 |
| 6.434999999999864 | 451.805 | 623.283 | 859.843 |
| 6.439999999999864 | 453.956 | 626.407 | 864.369 |
| 6.444999999999864 | 456.117 | 629.547 | 868.919 |
| 6.449999999999864 | 458.289 | 632.702 | 873.493 |
| 6.454999999999864 | 460.471 | 635.874 | 878.091 |
| 6.459999999999864 | 462.663 | 639.061 | 882.713 |
| 6.464999999999864 | 464.866 | 642.264 | 887.359 |
| 6.469999999999863 | 467.08 | 645.484 | 892.03 |
| 6.474999999999863 | 469.304 | 648.719 | 896.726 |
| 6.479999999999863 | 471.538 | 651.971 | 901.446 |
| 6.484999999999863 | 473.783 | 655.239 | 906.191 |
| 6.489999999999863 | 476.039 | 658.523 | 910.961 |
| 6.494999999999863 | 478.306 | 661.824 | 915.756 |
| 6.499999999999863 | 480.583 | 665.142 | 920.576 |
| 6.504999999999863 | 482.871 | 668.476 | 925.422 |
| 6.509999999999863 | 485.17 | 671.826 | 930.293 |
| 6.514999999999863 | 487.48 | 675.194 | 935.19 |
| 6.519999999999862 | 489.801 | 678.578 | 940.113 |
| 6.524999999999863 | 492.133 | 681.98 | 945.061 |
| 6.529999999999862 | 494.477 | 685.398 | 950.036 |
| 6.534999999999862 | 496.831 | 688.834 | 955.037 |
| 6.539999999999862 | 499.197 | 692.287 | 960.064 |
| 6.544999999999862 | 501.573 | 695.757 | 965.118 |
| 6.549999999999862 | 503.962 | 699.244 | 970.198 |
| 6.554999999999862 | 506.361 | 702.749 | 975.305 |
| 6.559999999999861 | 508.772 | 706.272 | 980.439 |
| 6.564999999999862 | 511.194 | 709.812 | 985.599 |
| 6.569999999999861 | 513.628 | 713.37 | 990.787 |
| 6.574999999999861 | 516.074 | 716.946 | 996.003 |
| 6.57999999999986 | 518.531 | 720.539 | 1001.245 |
| 6.584999999999861 | 521 | 724.151 | 1006.516 |
| 6.58999999999986 | 523.481 | 727.781 | 1011.814 |
| 6.594999999999861 | 525.973 | 731.429 | 1017.14 |
| 6.59999999999986 | 528.477 | 735.095 | 1022.494 |
| 6.604999999999861 | 530.994 | 738.78 | 1027.876 |
| 6.60999999999986 | 533.522 | 742.483 | 1033.287 |
| 6.614999999999861 | 536.062 | 746.205 | 1038.726 |
| 6.61999999999986 | 538.614 | 749.945 | 1044.193 |
| 6.62499999999986 | 541.179 | 753.704 | 1049.69 |
| 6.62999999999986 | 543.756 | 757.482 | 1055.215 |
| 6.63499999999986 | 546.345 | 761.279 | 1060.77 |
| 6.63999999999986 | 548.946 | 765.095 | 1066.353 |
| 6.64499999999986 | 551.56 | 768.93 | 1071.966 |
| 6.64999999999986 | 554.186 | 772.784 | 1077.609 |
| 6.65499999999986 | 556.824 | 776.658 | 1083.281 |
| 6.65999999999986 | 559.476 | 780.551 | 1088.984 |
| 6.66499999999986 | 562.139 | 784.463 | 1094.716 |
| 6.669999999999859 | 564.816 | 788.396 | 1100.478 |
| 6.674999999999859 | 567.505 | 792.347 | 1106.271 |
| 6.67999999999986 | 570.207 | 796.319 | 1112.094 |
| 6.684999999999859 | 572.922 | 800.311 | 1117.948 |
| 6.68999999999986 | 575.65 | 804.322 | 1123.833 |
| 6.694999999999859 | 578.391 | 808.354 | 1129.748 |
| 6.699999999999859 | 581.145 | 812.406 | 1135.695 |
| 6.704999999999859 | 583.912 | 816.478 | 1141.673 |
| 6.709999999999858 | 586.692 | 820.571 | 1147.683 |
| 6.714999999999859 | 589.485 | 824.684 | 1153.724 |
| 6.719999999999858 | 592.292 | 828.818 | 1159.797 |
| 6.724999999999858 | 595.112 | 832.972 | 1165.902 |
| 6.729999999999858 | 597.946 | 837.147 | 1172.039 |
| 6.734999999999858 | 600.793 | 841.343 | 1178.208 |
| 6.739999999999858 | 603.653 | 845.561 | 1184.41 |
| 6.744999999999858 | 606.527 | 849.799 | 1190.644 |
| 6.749999999999857 | 609.415 | 854.059 | 1196.912 |
| 6.754999999999858 | 612.317 | 858.34 | 1203.212 |
| 6.759999999999857 | 615.232 | 862.642 | 1209.546 |
| 6.764999999999857 | 618.162 | 866.966 | 1215.912 |
| 6.769999999999857 | 621.105 | 871.312 | 1222.313 |
| 6.774999999999857 | 624.062 | 875.679 | 1228.747 |
| 6.779999999999857 | 627.034 | 880.069 | 1235.215 |
| 6.784999999999857 | 630.019 | 884.48 | 1241.717 |
| 6.789999999999856 | 633.019 | 888.914 | 1248.253 |
| 6.794999999999857 | 636.033 | 893.369 | 1254.823 |
| 6.799999999999856 | 639.061 | 897.847 | 1261.428 |
| 6.804999999999857 | 642.104 | 902.348 | 1268.068 |
| 6.809999999999856 | 645.161 | 906.871 | 1274.743 |
| 6.814999999999856 | 648.233 | 911.417 | 1281.453 |
| 6.819999999999856 | 651.319 | 915.985 | 1288.198 |
| 6.824999999999856 | 654.42 | 920.576 | 1294.979 |
| 6.829999999999856 | 657.536 | 925.191 | 1301.796 |
| 6.834999999999856 | 660.667 | 929.828 | 1308.648 |
| 6.839999999999855 | 663.813 | 934.489 | 1315.537 |
| 6.844999999999856 | 666.973 | 939.173 | 1322.461 |
| 6.849999999999855 | 670.149 | 943.881 | 1329.423 |
| 6.854999999999856 | 673.34 | 948.612 | 1336.42 |
| 6.859999999999855 | 676.546 | 953.367 | 1343.455 |
| 6.864999999999855 | 679.767 | 958.146 | 1350.527 |
| 6.869999999999855 | 683.004 | 962.949 | 1357.636 |
| 6.874999999999855 | 686.255 | 967.775 | 1364.782 |
| 6.879999999999855 | 689.523 | 972.626 | 1371.966 |
| 6.884999999999855 | 692.806 | 977.502 | 1379.188 |
| 6.889999999999854 | 696.105 | 982.401 | 1386.448 |
| 6.894999999999855 | 699.419 | 987.326 | 1393.745 |
| 6.899999999999854 | 702.749 | 992.275 | 1401.082 |
| 6.904999999999854 | 706.095 | 997.249 | 1408.457 |
| 6.909999999999854 | 709.457 | 1002.247 | 1415.871 |
| 6.914999999999854 | 712.835 | 1007.271 | 1423.324 |
| 6.919999999999854 | 716.229 | 1012.32 | 1430.816 |
| 6.924999999999854 | 719.639 | 1017.394 | 1438.347 |
| 6.929999999999854 | 723.066 | 1022.494 | 1445.918 |
| 6.934999999999854 | 726.508 | 1027.619 | 1453.529 |
| 6.939999999999853 | 729.967 | 1032.77 | 1461.181 |
| 6.944999999999854 | 733.443 | 1037.947 | 1468.872 |
| 6.949999999999853 | 736.935 | 1043.15 | 1476.604 |
| 6.954999999999853 | 740.444 | 1048.379 | 1484.376 |
| 6.959999999999853 | 743.969 | 1053.634 | 1492.19 |
| 6.964999999999853 | 747.512 | 1058.915 | 1500.044 |
| 6.969999999999853 | 751.071 | 1064.223 | 1507.94 |
| 6.974999999999853 | 754.647 | 1069.557 | 1515.878 |
| 6.979999999999852 | 758.24 | 1074.918 | 1523.857 |
| 6.984999999999853 | 761.85 | 1080.306 | 1531.878 |
| 6.989999999999852 | 765.478 | 1085.721 | 1539.942 |
| 6.994999999999853 | 769.122 | 1091.164 | 1548.048 |
| 6.999999999999852 | 772.784 | 1096.633 | 1556.197 |
| 7.004999999999852 | 776.464 | 1102.13 | 1564.388 |
| 7.009999999999852 | 780.161 | 1107.655 | 1572.623 |
| 7.014999999999852 | 783.875 | 1113.207 | 1580.901 |
| 7.019999999999852 | 787.608 | 1118.787 | 1589.222 |
| 7.024999999999852 | 791.358 | 1124.395 | 1597.588 |
| 7.029999999999852 | 795.126 | 1130.031 | 1605.997 |
| 7.034999999999852 | 798.911 | 1135.695 | 1614.451 |
| 7.039999999999851 | 802.715 | 1141.388 | 1622.949 |
| 7.044999999999852 | 806.537 | 1147.109 | 1631.492 |
| 7.049999999999851 | 810.377 | 1152.859 | 1640.08 |
| 7.054999999999851 | 814.236 | 1158.637 | 1648.713 |
| 7.059999999999851 | 818.113 | 1164.445 | 1657.391 |
| 7.064999999999851 | 822.008 | 1170.282 | 1666.115 |
| 7.069999999999851 | 825.922 | 1176.148 | 1674.885 |
| 7.074999999999851 | 829.854 | 1182.044 | 1683.702 |
| 7.07999999999985 | 833.805 | 1187.969 | 1692.564 |
| 7.084999999999851 | 837.775 | 1193.923 | 1701.474 |
| 7.08999999999985 | 841.764 | 1199.908 | 1710.43 |
| 7.094999999999851 | 845.772 | 1205.922 | 1719.433 |
| 7.09999999999985 | 849.799 | 1211.967 | 1728.484 |
| 7.10499999999985 | 853.845 | 1218.042 | 1737.582 |
| 7.10999999999985 | 857.911 | 1224.148 | 1746.729 |
| 7.11499999999985 | 861.995 | 1230.284 | 1755.923 |
| 7.11999999999985 | 866.1 | 1236.45 | 1765.166 |
| 7.12499999999985 | 870.223 | 1242.648 | 1774.457 |
| 7.12999999999985 | 874.367 | 1248.877 | 1783.798 |
| 7.13499999999985 | 878.53 | 1255.137 | 1793.187 |
| 7.13999999999985 | 882.713 | 1261.428 | 1802.626 |
| 7.144999999999849 | 886.916 | 1267.751 | 1812.115 |
| 7.14999999999985 | 891.139 | 1274.106 | 1821.654 |
| 7.154999999999849 | 895.382 | 1280.492 | 1831.243 |
| 7.15999999999985 | 899.645 | 1286.911 | 1840.882 |
| 7.164999999999849 | 903.928 | 1293.362 | 1850.572 |
| 7.169999999999849 | 908.232 | 1299.845 | 1860.313 |
| 7.174999999999849 | 912.556 | 1306.36 | 1870.105 |
| 7.179999999999848 | 916.901 | 1312.908 | 1879.949 |
| 7.184999999999849 | 921.267 | 1319.489 | 1889.845 |
| 7.189999999999848 | 925.654 | 1326.103 | 1899.793 |
| 7.194999999999848 | 930.061 | 1332.75 | 1909.793 |
| 7.199999999999848 | 934.489 | 1339.431 | 1919.846 |
| 7.204999999999848 | 938.939 | 1346.145 | 1929.951 |
| 7.209999999999848 | 943.409 | 1352.892 | 1940.11 |
| 7.214999999999848 | 947.901 | 1359.674 | 1950.322 |
| 7.219999999999847 | 952.414 | 1366.489 | 1960.589 |
| 7.224999999999848 | 956.949 | 1373.339 | 1970.909 |
| 7.229999999999847 | 961.505 | 1380.223 | 1981.283 |
| 7.234999999999847 | 966.083 | 1387.141 | 1991.712 |
| 7.239999999999847 | 970.683 | 1394.094 | 2002.196 |
| 7.244999999999847 | 975.305 | 1401.082 | 2012.735 |
| 7.249999999999847 | 979.948 | 1408.105 | 2023.33 |
| 7.254999999999847 | 984.614 | 1415.163 | 2033.981 |
| 7.259999999999846 | 989.302 | 1422.257 | 2044.687 |
| 7.264999999999847 | 994.013 | 1429.386 | 2055.45 |
| 7.269999999999846 | 998.746 | 1436.55 | 2066.269 |
| 7.274999999999846 | 1003.501 | 1443.751 | 2077.146 |
| 7.279999999999846 | 1008.279 | 1450.988 | 2088.079 |
| 7.284999999999846 | 1013.08 | 1458.261 | 2099.071 |
| 7.289999999999846 | 1017.903 | 1465.571 | 2110.12 |
| 7.294999999999846 | 1022.75 | 1472.917 | 2121.227 |
| 7.299999999999846 | 1027.619 | 1480.3 | 2132.393 |
| 7.304999999999846 | 1032.512 | 1487.72 | 2143.617 |
| 7.309999999999845 | 1037.428 | 1495.177 | 2154.901 |
| 7.314999999999846 | 1042.368 | 1502.672 | 2166.244 |
| 7.319999999999845 | 1047.331 | 1510.204 | 2177.647 |
| 7.324999999999846 | 1052.317 | 1517.774 | 2189.109 |
| 7.329999999999845 | 1057.328 | 1525.382 | 2200.632 |
| 7.334999999999845 | 1062.362 | 1533.028 | 2212.216 |
| 7.339999999999845 | 1067.42 | 1540.712 | 2223.861 |
| 7.344999999999845 | 1072.503 | 1548.435 | 2235.567 |
| 7.349999999999845 | 1077.609 | 1556.197 | 2247.334 |
| 7.354999999999845 | 1082.74 | 1563.997 | 2259.164 |
| 7.359999999999844 | 1087.895 | 1571.837 | 2271.056 |
| 7.364999999999845 | 1093.075 | 1579.715 | 2283.01 |
| 7.369999999999844 | 1098.279 | 1587.634 | 2295.027 |
| 7.374999999999844 | 1103.509 | 1595.592 | 2307.108 |
| 7.379999999999844 | 1108.763 | 1603.59 | 2319.252 |
| 7.384999999999844 | 1114.042 | 1611.628 | 2331.46 |
| 7.389999999999844 | 1119.346 | 1619.706 | 2343.732 |
| 7.394999999999844 | 1124.676 | 1627.825 | 2356.069 |
| 7.399999999999844 | 1130.031 | 1635.984 | 2368.471 |
| 7.404999999999844 | 1135.411 | 1644.185 | 2380.938 |
| 7.409999999999843 | 1140.817 | 1652.426 | 2393.471 |
| 7.414999999999844 | 1146.249 | 1660.709 | 2406.07 |
| 7.419999999999843 | 1151.706 | 1669.034 | 2418.735 |
| 7.424999999999843 | 1157.19 | 1677.4 | 2431.467 |
| 7.429999999999843 | 1162.7 | 1685.808 | 2444.266 |
| 7.434999999999843 | 1168.236 | 1694.258 | 2457.132 |
| 7.439999999999843 | 1173.798 | 1702.75 | 2470.066 |
| 7.444999999999843 | 1179.387 | 1711.285 | 2483.068 |
| 7.449999999999842 | 1185.002 | 1719.863 | 2496.138 |
| 7.454999999999843 | 1190.644 | 1728.484 | 2509.277 |
| 7.459999999999842 | 1196.313 | 1737.148 | 2522.485 |
| 7.464999999999843 | 1202.009 | 1745.856 | 2535.763 |
| 7.469999999999842 | 1207.733 | 1754.607 | 2549.111 |
| 7.474999999999842 | 1213.483 | 1763.402 | 2562.529 |
| 7.479999999999842 | 1219.261 | 1772.241 | 2576.018 |
| 7.484999999999842 | 1225.066 | 1781.124 | 2589.577 |
| 7.489999999999842 | 1230.899 | 1790.052 | 2603.208 |
| 7.494999999999842 | 1236.76 | 1799.025 | 2616.911 |
| 7.499999999999841 | 1242.648 | 1808.042 | 2630.686 |
| 7.504999999999842 | 1248.565 | 1817.105 | 2644.534 |
| 7.509999999999841 | 1254.51 | 1826.214 | 2658.454 |
| 7.514999999999842 | 1260.483 | 1835.367 | 2672.448 |
| 7.519999999999841 | 1266.484 | 1844.567 | 2686.515 |
| 7.524999999999841 | 1272.514 | 1853.813 | 2700.656 |
| 7.529999999999841 | 1278.573 | 1863.106 | 2714.872 |
| 7.534999999999841 | 1284.661 | 1872.444 | 2729.162 |
| 7.53999999999984 | 1290.777 | 1881.83 | 2743.528 |
| 7.544999999999841 | 1296.923 | 1891.263 | 2757.97 |
| 7.54999999999984 | 1303.098 | 1900.743 | 2772.487 |
| 7.554999999999841 | 1309.303 | 1910.27 | 2787.081 |
| 7.55999999999984 | 1315.537 | 1919.846 | 2801.751 |
| 7.564999999999841 | 1321.8 | 1929.469 | 2816.499 |
| 7.56999999999984 | 1328.094 | 1939.14 | 2831.325 |
| 7.57499999999984 | 1334.417 | 1948.86 | 2846.228 |
| 7.57999999999984 | 1340.771 | 1958.629 | 2861.21 |
| 7.58499999999984 | 1347.155 | 1968.447 | 2876.271 |
| 7.58999999999984 | 1353.569 | 1978.314 | 2891.411 |
| 7.59499999999984 | 1360.014 | 1988.23 | 2906.631 |
| 7.59999999999984 | 1366.489 | 1998.196 | 2921.931 |
| 7.60499999999984 | 1372.995 | 2008.212 | 2937.312 |
| 7.60999999999984 | 1379.533 | 2018.278 | 2952.773 |
| 7.614999999999839 | 1386.101 | 2028.395 | 2968.316 |
| 7.61999999999984 | 1392.701 | 2038.562 | 2983.94 |
| 7.624999999999839 | 1399.332 | 2048.78 | 2999.647 |
| 7.62999999999984 | 1405.994 | 2059.05 | 3015.437 |
| 7.634999999999839 | 1412.689 | 2069.371 | 3031.31 |
| 7.639999999999838 | 1419.415 | 2079.744 | 3047.266 |
| 7.644999999999839 | 1426.173 | 2090.169 | 3063.306 |
| 7.649999999999838 | 1432.964 | 2100.646 | 3079.431 |
| 7.654999999999839 | 1439.786 | 2111.175 | 3095.64 |
| 7.659999999999838 | 1446.642 | 2121.757 | 3111.935 |
| 7.664999999999838 | 1453.529 | 2132.393 | 3128.316 |
| 7.669999999999838 | 1460.45 | 2143.081 | 3144.782 |
| 7.674999999999838 | 1467.404 | 2153.824 | 3161.336 |
| 7.679999999999837 | 1474.391 | 2164.62 | 3177.977 |
| 7.684999999999838 | 1481.411 | 2175.47 | 3194.705 |
| 7.689999999999837 | 1488.464 | 2186.375 | 3211.521 |
| 7.694999999999838 | 1495.551 | 2197.334 | 3228.426 |
| 7.699999999999837 | 1502.672 | 2208.348 | 3245.42 |
| 7.704999999999837 | 1509.826 | 2219.417 | 3262.503 |
| 7.709999999999837 | 1517.015 | 2230.542 | 3279.676 |
| 7.714999999999837 | 1524.238 | 2241.723 | 3296.94 |
| 7.719999999999837 | 1531.496 | 2252.96 | 3314.294 |
| 7.724999999999837 | 1538.787 | 2264.253 | 3331.74 |
| 7.729999999999836 | 1546.114 | 2275.602 | 3349.278 |
| 7.734999999999836 | 1553.476 | 2287.009 | 3366.908 |
| 7.739999999999836 | 1560.872 | 2298.472 | 3384.63 |
| 7.744999999999836 | 1568.304 | 2309.994 | 3402.446 |
| 7.749999999999836 | 1575.771 | 2321.572 | 3420.356 |
| 7.754999999999836 | 1583.274 | 2333.209 | 3438.36 |
| 7.759999999999836 | 1590.812 | 2344.905 | 3456.459 |
| 7.764999999999836 | 1598.387 | 2356.658 | 3474.653 |
| 7.769999999999836 | 1605.997 | 2368.471 | 3492.943 |
| 7.774999999999835 | 1613.644 | 2380.343 | 3511.329 |
| 7.779999999999835 | 1621.327 | 2392.275 | 3529.812 |
| 7.784999999999835 | 1629.046 | 2404.266 | 3548.393 |
| 7.789999999999835 | 1636.803 | 2416.318 | 3567.071 |
| 7.794999999999835 | 1644.596 | 2428.429 | 3585.847 |
| 7.799999999999835 | 1652.426 | 2440.602 | 3604.722 |
| 7.804999999999835 | 1660.294 | 2452.836 | 3623.697 |
| 7.809999999999835 | 1668.199 | 2465.13 | 3642.771 |
| 7.814999999999835 | 1676.142 | 2477.487 | 3661.946 |
| 7.819999999999835 | 1684.123 | 2489.905 | 3681.222 |
| 7.824999999999835 | 1692.141 | 2502.386 | 3700.599 |
| 7.829999999999834 | 1700.198 | 2514.929 | 3720.078 |
| 7.834999999999834 | 1708.293 | 2527.536 | 3739.66 |
| 7.839999999999834 | 1716.427 | 2540.205 | 3759.345 |
| 7.844999999999834 | 1724.599 | 2552.938 | 3779.133 |
| 7.849999999999834 | 1732.811 | 2565.734 | 3799.026 |
| 7.854999999999834 | 1741.061 | 2578.595 | 3819.023 |
| 7.859999999999834 | 1749.351 | 2591.52 | 3839.126 |
| 7.864999999999834 | 1757.68 | 2604.51 | 3859.334 |
| 7.869999999999834 | 1766.049 | 2617.566 | 3879.649 |
| 7.874999999999834 | 1774.457 | 2630.686 | 3900.071 |
| 7.879999999999833 | 1782.906 | 2643.873 | 3920.6 |
| 7.884999999999834 | 1791.395 | 2657.125 | 3941.237 |
| 7.889999999999833 | 1799.925 | 2670.444 | 3961.983 |
| 7.894999999999833 | 1808.494 | 2683.83 | 3982.838 |
| 7.899999999999833 | 1817.105 | 2697.282 | 4003.803 |
| 7.904999999999833 | 1825.757 | 2710.803 | 4024.878 |
| 7.909999999999833 | 1834.45 | 2724.39 | 4046.065 |
| 7.914999999999833 | 1843.184 | 2738.047 | 4067.362 |
| 7.919999999999832 | 1851.96 | 2751.771 | 4088.772 |
| 7.924999999999833 | 1860.778 | 2765.564 | 4110.295 |
| 7.929999999999832 | 1869.638 | 2779.427 | 4131.93 |
| 7.934999999999832 | 1878.54 | 2793.359 | 4153.68 |
| 7.939999999999832 | 1887.484 | 2807.361 | 4175.544 |
| 7.944999999999832 | 1896.471 | 2821.432 | 4197.524 |
| 7.949999999999832 | 1905.501 | 2835.575 | 4219.618 |
| 7.954999999999832 | 1914.573 | 2849.788 | 4241.83 |
| 7.959999999999832 | 1923.689 | 2864.073 | 4264.158 |
| 7.964999999999832 | 1932.848 | 2878.429 | 4286.604 |
| 7.969999999999831 | 1942.051 | 2892.857 | 4309.167 |
| 7.974999999999831 | 1951.298 | 2907.358 | 4331.85 |
| 7.97999999999983 | 1960.589 | 2921.931 | 4354.652 |
| 7.984999999999831 | 1969.924 | 2936.577 | 4377.574 |
| 7.98999999999983 | 1979.303 | 2951.297 | 4400.617 |
| 7.994999999999831 | 1988.727 | 2966.09 | 4423.781 |
| 7.99999999999983 | 1998.196 | 2980.958 | 4447.067 |